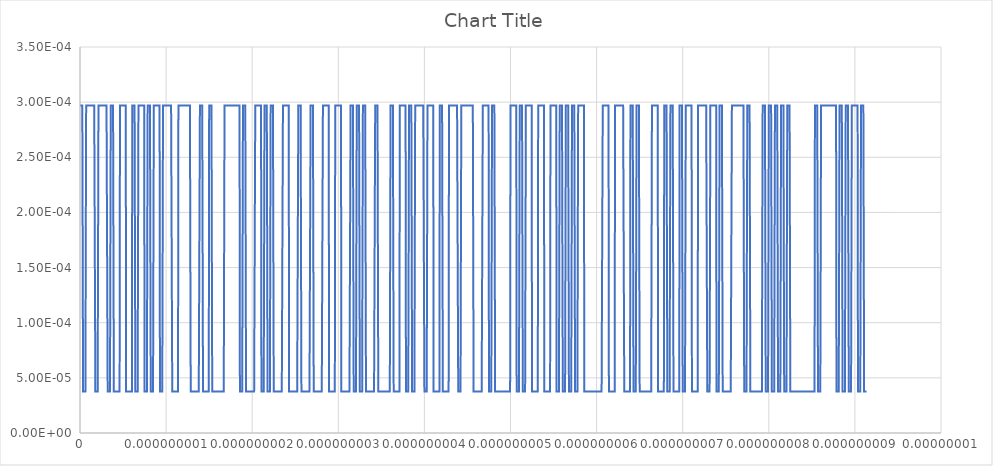
| Category | Series 0 |
|---|---|
| 0.0 | 0 |
| 2.23214285714285e-12 | 0 |
| 4.46428571428571e-12 | 0 |
| 6.69642857142857e-12 | 0 |
| 8.92857142857142e-12 | 0 |
| 1.11607142857142e-11 | 0 |
| 1.33928571428571e-11 | 0 |
| 1.5625e-11 | 0 |
| 1.78571428571428e-11 | 0 |
| 2.00892857142857e-11 | 0 |
| 2.23214285714285e-11 | 0 |
| 2.45535714285714e-11 | 0 |
| 2.67857142857142e-11 | 0 |
| 2.90178571428571e-11 | 0 |
| 3.125e-11 | 0 |
| 3.34821428571428e-11 | 0 |
| 3.57142857142857e-11 | 0 |
| 3.79464285714285e-11 | 0 |
| 4.01785714285714e-11 | 0 |
| 4.24107142857142e-11 | 0 |
| 4.46428571428571e-11 | 0 |
| 4.6875e-11 | 0 |
| 4.91071428571428e-11 | 0 |
| 5.13392857142857e-11 | 0 |
| 5.35714285714285e-11 | 0 |
| 5.58035714285714e-11 | 0 |
| 5.80357142857142e-11 | 0 |
| 6.02678571428571e-11 | 0 |
| 6.25e-11 | 0 |
| 6.47321428571428e-11 | 0 |
| 6.69642857142857e-11 | 0 |
| 6.91964285714285e-11 | 0 |
| 7.14285714285714e-11 | 0 |
| 7.36607142857142e-11 | 0 |
| 7.58928571428571e-11 | 0 |
| 7.8125e-11 | 0 |
| 8.03571428571428e-11 | 0 |
| 8.25892857142857e-11 | 0 |
| 8.48214285714285e-11 | 0 |
| 8.70535714285714e-11 | 0 |
| 8.92857142857142e-11 | 0 |
| 9.15178571428571e-11 | 0 |
| 9.37499999999999e-11 | 0 |
| 9.59821428571428e-11 | 0 |
| 9.82142857142857e-11 | 0 |
| 1.00446428571428e-10 | 0 |
| 1.02678571428571e-10 | 0 |
| 1.04910714285714e-10 | 0 |
| 1.07142857142857e-10 | 0 |
| 1.09375e-10 | 0 |
| 1.11607142857142e-10 | 0 |
| 1.13839285714285e-10 | 0 |
| 1.16071428571428e-10 | 0 |
| 1.18303571428571e-10 | 0 |
| 1.20535714285714e-10 | 0 |
| 1.22767857142857e-10 | 0 |
| 1.25e-10 | 0 |
| 1.27232142857142e-10 | 0 |
| 1.29464285714285e-10 | 0 |
| 1.31696428571428e-10 | 0 |
| 1.33928571428571e-10 | 0 |
| 1.36160714285714e-10 | 0 |
| 1.38392857142857e-10 | 0 |
| 1.40624999999999e-10 | 0 |
| 1.42857142857142e-10 | 0 |
| 1.45089285714285e-10 | 0 |
| 1.47321428571428e-10 | 0 |
| 1.49553571428571e-10 | 0 |
| 1.51785714285714e-10 | 0 |
| 1.54017857142857e-10 | 0 |
| 1.5625e-10 | 0 |
| 1.58482142857142e-10 | 0 |
| 1.60714285714285e-10 | 0 |
| 1.62946428571428e-10 | 0 |
| 1.65178571428571e-10 | 0 |
| 1.67410714285714e-10 | 0 |
| 1.69642857142857e-10 | 0 |
| 1.71874999999999e-10 | 0 |
| 1.74107142857142e-10 | 0 |
| 1.76339285714285e-10 | 0 |
| 1.78571428571428e-10 | 0 |
| 1.80803571428571e-10 | 0 |
| 1.83035714285714e-10 | 0 |
| 1.85267857142857e-10 | 0 |
| 1.875e-10 | 0 |
| 1.89732142857142e-10 | 0 |
| 1.91964285714285e-10 | 0 |
| 1.94196428571428e-10 | 0 |
| 1.96428571428571e-10 | 0 |
| 1.98660714285714e-10 | 0 |
| 2.00892857142857e-10 | 0 |
| 2.03125e-10 | 0 |
| 2.05357142857142e-10 | 0 |
| 2.07589285714285e-10 | 0 |
| 2.09821428571428e-10 | 0 |
| 2.12053571428571e-10 | 0 |
| 2.14285714285714e-10 | 0 |
| 2.16517857142857e-10 | 0 |
| 2.18749999999999e-10 | 0 |
| 2.20982142857142e-10 | 0 |
| 2.23214285714285e-10 | 0 |
| 2.25446428571428e-10 | 0 |
| 2.27678571428571e-10 | 0 |
| 2.29910714285714e-10 | 0 |
| 2.32142857142857e-10 | 0 |
| 2.34374999999999e-10 | 0 |
| 2.36607142857142e-10 | 0 |
| 2.38839285714285e-10 | 0 |
| 2.41071428571428e-10 | 0 |
| 2.43303571428571e-10 | 0 |
| 2.45535714285714e-10 | 0 |
| 2.47767857142857e-10 | 0 |
| 2.5e-10 | 0 |
| 2.52232142857142e-10 | 0 |
| 2.54464285714285e-10 | 0 |
| 2.56696428571428e-10 | 0 |
| 2.58928571428571e-10 | 0 |
| 2.61160714285714e-10 | 0 |
| 2.63392857142857e-10 | 0 |
| 2.65625e-10 | 0 |
| 2.67857142857142e-10 | 0 |
| 2.70089285714285e-10 | 0 |
| 2.72321428571428e-10 | 0 |
| 2.74553571428571e-10 | 0 |
| 2.76785714285714e-10 | 0 |
| 2.79017857142857e-10 | 0 |
| 2.81249999999999e-10 | 0 |
| 2.83482142857142e-10 | 0 |
| 2.85714285714285e-10 | 0 |
| 2.87946428571428e-10 | 0 |
| 2.90178571428571e-10 | 0 |
| 2.92410714285714e-10 | 0 |
| 2.94642857142857e-10 | 0 |
| 2.96874999999999e-10 | 0 |
| 2.99107142857142e-10 | 0 |
| 3.01339285714285e-10 | 0 |
| 3.03571428571428e-10 | 0 |
| 3.05803571428571e-10 | 0 |
| 3.08035714285714e-10 | 0 |
| 3.10267857142857e-10 | 0 |
| 3.125e-10 | 0 |
| 3.14732142857142e-10 | 0 |
| 3.16964285714285e-10 | 0 |
| 3.19196428571428e-10 | 0 |
| 3.21428571428571e-10 | 0 |
| 3.23660714285714e-10 | 0 |
| 3.25892857142857e-10 | 0 |
| 3.28124999999999e-10 | 0 |
| 3.30357142857142e-10 | 0 |
| 3.32589285714285e-10 | 0 |
| 3.34821428571428e-10 | 0 |
| 3.37053571428571e-10 | 0 |
| 3.39285714285714e-10 | 0 |
| 3.41517857142857e-10 | 0 |
| 3.43749999999999e-10 | 0 |
| 3.45982142857142e-10 | 0 |
| 3.48214285714285e-10 | 0 |
| 3.50446428571428e-10 | 0 |
| 3.52678571428571e-10 | 0 |
| 3.54910714285714e-10 | 0 |
| 3.57142857142857e-10 | 0 |
| 3.59375e-10 | 0 |
| 3.61607142857142e-10 | 0 |
| 3.63839285714285e-10 | 0 |
| 3.66071428571428e-10 | 0 |
| 3.68303571428571e-10 | 0 |
| 3.70535714285714e-10 | 0 |
| 3.72767857142857e-10 | 0 |
| 3.75e-10 | 0 |
| 3.77232142857142e-10 | 0 |
| 3.79464285714285e-10 | 0 |
| 3.81696428571428e-10 | 0 |
| 3.83928571428571e-10 | 0 |
| 3.86160714285714e-10 | 0 |
| 3.88392857142857e-10 | 0 |
| 3.90624999999999e-10 | 0 |
| 3.92857142857142e-10 | 0 |
| 3.95089285714285e-10 | 0 |
| 3.97321428571428e-10 | 0 |
| 3.99553571428571e-10 | 0 |
| 4.01785714285714e-10 | 0 |
| 4.04017857142857e-10 | 0 |
| 4.0625e-10 | 0 |
| 4.08482142857142e-10 | 0 |
| 4.10714285714285e-10 | 0 |
| 4.12946428571428e-10 | 0 |
| 4.15178571428571e-10 | 0 |
| 4.17410714285714e-10 | 0 |
| 4.19642857142857e-10 | 0 |
| 4.21875e-10 | 0 |
| 4.24107142857142e-10 | 0 |
| 4.26339285714285e-10 | 0 |
| 4.28571428571428e-10 | 0 |
| 4.30803571428571e-10 | 0 |
| 4.33035714285714e-10 | 0 |
| 4.35267857142857e-10 | 0 |
| 4.37499999999999e-10 | 0 |
| 4.39732142857142e-10 | 0 |
| 4.41964285714285e-10 | 0 |
| 4.44196428571428e-10 | 0 |
| 4.46428571428571e-10 | 0 |
| 4.48660714285714e-10 | 0 |
| 4.50892857142857e-10 | 0 |
| 4.53124999999999e-10 | 0 |
| 4.55357142857142e-10 | 0 |
| 4.57589285714285e-10 | 0 |
| 4.59821428571428e-10 | 0 |
| 4.62053571428571e-10 | 0 |
| 4.64285714285714e-10 | 0 |
| 4.66517857142857e-10 | 0 |
| 4.68749999999999e-10 | 0 |
| 4.70982142857142e-10 | 0 |
| 4.73214285714285e-10 | 0 |
| 4.75446428571428e-10 | 0 |
| 4.77678571428571e-10 | 0 |
| 4.79910714285714e-10 | 0 |
| 4.82142857142857e-10 | 0 |
| 4.84374999999999e-10 | 0 |
| 4.86607142857142e-10 | 0 |
| 4.88839285714285e-10 | 0 |
| 4.91071428571428e-10 | 0 |
| 4.93303571428571e-10 | 0 |
| 4.95535714285714e-10 | 0 |
| 4.97767857142857e-10 | 0 |
| 5e-10 | 0 |
| 5.02232142857142e-10 | 0 |
| 5.04464285714285e-10 | 0 |
| 5.06696428571428e-10 | 0 |
| 5.08928571428571e-10 | 0 |
| 5.11160714285714e-10 | 0 |
| 5.13392857142857e-10 | 0 |
| 5.15624999999999e-10 | 0 |
| 5.17857142857142e-10 | 0 |
| 5.20089285714285e-10 | 0 |
| 5.22321428571428e-10 | 0 |
| 5.24553571428571e-10 | 0 |
| 5.26785714285714e-10 | 0 |
| 5.29017857142857e-10 | 0 |
| 5.3125e-10 | 0 |
| 5.33482142857142e-10 | 0 |
| 5.35714285714285e-10 | 0 |
| 5.37946428571428e-10 | 0 |
| 5.40178571428571e-10 | 0 |
| 5.42410714285714e-10 | 0 |
| 5.44642857142857e-10 | 0 |
| 5.46875e-10 | 0 |
| 5.49107142857142e-10 | 0 |
| 5.51339285714285e-10 | 0 |
| 5.53571428571428e-10 | 0 |
| 5.55803571428571e-10 | 0 |
| 5.58035714285714e-10 | 0 |
| 5.60267857142857e-10 | 0 |
| 5.62499999999999e-10 | 0 |
| 5.64732142857142e-10 | 0 |
| 5.66964285714285e-10 | 0 |
| 5.69196428571428e-10 | 0 |
| 5.71428571428571e-10 | 0 |
| 5.73660714285714e-10 | 0 |
| 5.75892857142857e-10 | 0 |
| 5.78125e-10 | 0 |
| 5.80357142857142e-10 | 0 |
| 5.82589285714285e-10 | 0 |
| 5.84821428571428e-10 | 0 |
| 5.87053571428571e-10 | 0 |
| 5.89285714285714e-10 | 0 |
| 5.91517857142857e-10 | 0 |
| 5.93749999999999e-10 | 0 |
| 5.95982142857142e-10 | 0 |
| 5.98214285714285e-10 | 0 |
| 6.00446428571428e-10 | 0 |
| 6.02678571428571e-10 | 0 |
| 6.04910714285714e-10 | 0 |
| 6.07142857142857e-10 | 0 |
| 6.09374999999999e-10 | 0 |
| 6.11607142857142e-10 | 0 |
| 6.13839285714285e-10 | 0 |
| 6.16071428571428e-10 | 0 |
| 6.18303571428571e-10 | 0 |
| 6.20535714285714e-10 | 0 |
| 6.22767857142857e-10 | 0 |
| 6.25e-10 | 0 |
| 6.27232142857142e-10 | 0 |
| 6.29464285714285e-10 | 0 |
| 6.31696428571428e-10 | 0 |
| 6.33928571428571e-10 | 0 |
| 6.36160714285714e-10 | 0 |
| 6.38392857142857e-10 | 0 |
| 6.40624999999999e-10 | 0 |
| 6.42857142857142e-10 | 0 |
| 6.45089285714285e-10 | 0 |
| 6.47321428571428e-10 | 0 |
| 6.49553571428571e-10 | 0 |
| 6.51785714285714e-10 | 0 |
| 6.54017857142857e-10 | 0 |
| 6.56249999999999e-10 | 0 |
| 6.58482142857142e-10 | 0 |
| 6.60714285714285e-10 | 0 |
| 6.62946428571428e-10 | 0 |
| 6.65178571428571e-10 | 0 |
| 6.67410714285714e-10 | 0 |
| 6.69642857142857e-10 | 0 |
| 6.71875e-10 | 0 |
| 6.74107142857142e-10 | 0 |
| 6.76339285714285e-10 | 0 |
| 6.78571428571428e-10 | 0 |
| 6.80803571428571e-10 | 0 |
| 6.83035714285714e-10 | 0 |
| 6.85267857142857e-10 | 0 |
| 6.87499999999999e-10 | 0 |
| 6.89732142857142e-10 | 0 |
| 6.91964285714285e-10 | 0 |
| 6.94196428571428e-10 | 0 |
| 6.96428571428571e-10 | 0 |
| 6.98660714285714e-10 | 0 |
| 7.00892857142857e-10 | 0 |
| 7.03124999999999e-10 | 0 |
| 7.05357142857142e-10 | 0 |
| 7.07589285714285e-10 | 0 |
| 7.09821428571428e-10 | 0 |
| 7.12053571428571e-10 | 0 |
| 7.14285714285714e-10 | 0 |
| 7.16517857142857e-10 | 0 |
| 7.1875e-10 | 0 |
| 7.20982142857142e-10 | 0 |
| 7.23214285714285e-10 | 0 |
| 7.25446428571428e-10 | 0 |
| 7.27678571428571e-10 | 0 |
| 7.29910714285714e-10 | 0 |
| 7.32142857142857e-10 | 0 |
| 7.34374999999999e-10 | 0 |
| 7.36607142857142e-10 | 0 |
| 7.38839285714285e-10 | 0 |
| 7.41071428571428e-10 | 0 |
| 7.43303571428571e-10 | 0 |
| 7.45535714285714e-10 | 0 |
| 7.47767857142857e-10 | 0 |
| 7.5e-10 | 0 |
| 7.52232142857142e-10 | 0 |
| 7.54464285714285e-10 | 0 |
| 7.56696428571428e-10 | 0 |
| 7.58928571428571e-10 | 0 |
| 7.61160714285714e-10 | 0 |
| 7.63392857142857e-10 | 0 |
| 7.65625e-10 | 0 |
| 7.67857142857142e-10 | 0 |
| 7.70089285714285e-10 | 0 |
| 7.72321428571428e-10 | 0 |
| 7.74553571428571e-10 | 0 |
| 7.76785714285714e-10 | 0 |
| 7.79017857142857e-10 | 0 |
| 7.81249999999999e-10 | 0 |
| 7.83482142857142e-10 | 0 |
| 7.85714285714285e-10 | 0 |
| 7.87946428571428e-10 | 0 |
| 7.90178571428571e-10 | 0 |
| 7.92410714285714e-10 | 0 |
| 7.94642857142857e-10 | 0 |
| 7.96875e-10 | 0 |
| 7.99107142857142e-10 | 0 |
| 8.01339285714285e-10 | 0 |
| 8.03571428571428e-10 | 0 |
| 8.05803571428571e-10 | 0 |
| 8.08035714285714e-10 | 0 |
| 8.10267857142857e-10 | 0 |
| 8.125e-10 | 0 |
| 8.14732142857142e-10 | 0 |
| 8.16964285714285e-10 | 0 |
| 8.19196428571428e-10 | 0 |
| 8.21428571428571e-10 | 0 |
| 8.23660714285714e-10 | 0 |
| 8.25892857142857e-10 | 0 |
| 8.28124999999999e-10 | 0 |
| 8.30357142857142e-10 | 0 |
| 8.32589285714285e-10 | 0 |
| 8.34821428571428e-10 | 0 |
| 8.37053571428571e-10 | 0 |
| 8.39285714285714e-10 | 0 |
| 8.41517857142857e-10 | 0 |
| 8.4375e-10 | 0 |
| 8.45982142857142e-10 | 0 |
| 8.48214285714285e-10 | 0 |
| 8.50446428571428e-10 | 0 |
| 8.52678571428571e-10 | 0 |
| 8.54910714285714e-10 | 0 |
| 8.57142857142857e-10 | 0 |
| 8.59374999999999e-10 | 0 |
| 8.61607142857142e-10 | 0 |
| 8.63839285714285e-10 | 0 |
| 8.66071428571428e-10 | 0 |
| 8.68303571428571e-10 | 0 |
| 8.70535714285714e-10 | 0 |
| 8.72767857142857e-10 | 0 |
| 8.74999999999999e-10 | 0 |
| 8.77232142857142e-10 | 0 |
| 8.79464285714285e-10 | 0 |
| 8.81696428571428e-10 | 0 |
| 8.83928571428571e-10 | 0 |
| 8.86160714285714e-10 | 0 |
| 8.88392857142857e-10 | 0 |
| 8.90625e-10 | 0 |
| 8.92857142857142e-10 | 0 |
| 8.95089285714285e-10 | 0 |
| 8.97321428571428e-10 | 0 |
| 8.99553571428571e-10 | 0 |
| 9.01785714285714e-10 | 0 |
| 9.04017857142857e-10 | 0 |
| 9.06249999999999e-10 | 0 |
| 9.08482142857142e-10 | 0 |
| 9.10714285714285e-10 | 0 |
| 9.12946428571428e-10 | 0 |
| 9.15178571428571e-10 | 0 |
| 9.17410714285714e-10 | 0 |
| 9.19642857142857e-10 | 0 |
| 9.21874999999999e-10 | 0 |
| 9.24107142857142e-10 | 0 |
| 9.26339285714285e-10 | 0 |
| 9.28571428571428e-10 | 0 |
| 9.30803571428571e-10 | 0 |
| 9.33035714285714e-10 | 0 |
| 9.35267857142857e-10 | 0 |
| 9.37499999999999e-10 | 0 |
| 9.39732142857142e-10 | 0 |
| 9.41964285714285e-10 | 0 |
| 9.44196428571428e-10 | 0 |
| 9.46428571428571e-10 | 0 |
| 9.48660714285714e-10 | 0 |
| 9.50892857142857e-10 | 0 |
| 9.53125e-10 | 0 |
| 9.55357142857142e-10 | 0 |
| 9.57589285714285e-10 | 0 |
| 9.59821428571428e-10 | 0 |
| 9.62053571428571e-10 | 0 |
| 9.64285714285714e-10 | 0 |
| 9.66517857142857e-10 | 0 |
| 9.68749999999999e-10 | 0 |
| 9.70982142857142e-10 | 0 |
| 9.73214285714285e-10 | 0 |
| 9.75446428571428e-10 | 0 |
| 9.77678571428571e-10 | 0 |
| 9.79910714285714e-10 | 0 |
| 9.82142857142857e-10 | 0 |
| 9.84374999999999e-10 | 0 |
| 9.86607142857142e-10 | 0 |
| 9.88839285714285e-10 | 0 |
| 9.91071428571428e-10 | 0 |
| 9.93303571428571e-10 | 0 |
| 9.95535714285714e-10 | 0 |
| 9.97767857142857e-10 | 0 |
| 1e-09 | 0 |
| 1.00223214285714e-09 | 0 |
| 1.00446428571428e-09 | 0 |
| 1.00669642857142e-09 | 0 |
| 1.00892857142857e-09 | 0 |
| 1.01116071428571e-09 | 0 |
| 1.01339285714285e-09 | 0 |
| 1.015625e-09 | 0 |
| 1.01785714285714e-09 | 0 |
| 1.02008928571428e-09 | 0 |
| 1.02232142857142e-09 | 0 |
| 1.02455357142857e-09 | 0 |
| 1.02678571428571e-09 | 0 |
| 1.02901785714285e-09 | 0 |
| 1.03124999999999e-09 | 0 |
| 1.03348214285714e-09 | 0 |
| 1.03571428571428e-09 | 0 |
| 1.03794642857142e-09 | 0 |
| 1.04017857142857e-09 | 0 |
| 1.04241071428571e-09 | 0 |
| 1.04464285714285e-09 | 0 |
| 1.046875e-09 | 0 |
| 1.04910714285714e-09 | 0 |
| 1.05133928571428e-09 | 0 |
| 1.05357142857142e-09 | 0 |
| 1.05580357142857e-09 | 0 |
| 1.05803571428571e-09 | 0 |
| 1.06026785714285e-09 | 0 |
| 1.0625e-09 | 0 |
| 1.06473214285714e-09 | 0 |
| 1.06696428571428e-09 | 0 |
| 1.06919642857142e-09 | 0 |
| 1.07142857142857e-09 | 0 |
| 1.07366071428571e-09 | 0 |
| 1.07589285714285e-09 | 0 |
| 1.07812499999999e-09 | 0 |
| 1.08035714285714e-09 | 0 |
| 1.08258928571428e-09 | 0 |
| 1.08482142857142e-09 | 0 |
| 1.08705357142857e-09 | 0 |
| 1.08928571428571e-09 | 0 |
| 1.09151785714285e-09 | 0 |
| 1.09375e-09 | 0 |
| 1.09598214285714e-09 | 0 |
| 1.09821428571428e-09 | 0 |
| 1.10044642857142e-09 | 0 |
| 1.10267857142857e-09 | 0 |
| 1.10491071428571e-09 | 0 |
| 1.10714285714285e-09 | 0 |
| 1.109375e-09 | 0 |
| 1.11160714285714e-09 | 0 |
| 1.11383928571428e-09 | 0 |
| 1.11607142857142e-09 | 0 |
| 1.11830357142857e-09 | 0 |
| 1.12053571428571e-09 | 0 |
| 1.12276785714285e-09 | 0 |
| 1.12499999999999e-09 | 0 |
| 1.12723214285714e-09 | 0 |
| 1.12946428571428e-09 | 0 |
| 1.13169642857142e-09 | 0 |
| 1.13392857142857e-09 | 0 |
| 1.13616071428571e-09 | 0 |
| 1.13839285714285e-09 | 0 |
| 1.140625e-09 | 0 |
| 1.14285714285714e-09 | 0 |
| 1.14508928571428e-09 | 0 |
| 1.14732142857142e-09 | 0 |
| 1.14955357142857e-09 | 0 |
| 1.15178571428571e-09 | 0 |
| 1.15401785714285e-09 | 0 |
| 1.15625e-09 | 0 |
| 1.15848214285714e-09 | 0 |
| 1.16071428571428e-09 | 0 |
| 1.16294642857142e-09 | 0 |
| 1.16517857142857e-09 | 0 |
| 1.16741071428571e-09 | 0 |
| 1.16964285714285e-09 | 0 |
| 1.17187499999999e-09 | 0 |
| 1.17410714285714e-09 | 0 |
| 1.17633928571428e-09 | 0 |
| 1.17857142857142e-09 | 0 |
| 1.18080357142857e-09 | 0 |
| 1.18303571428571e-09 | 0 |
| 1.18526785714285e-09 | 0 |
| 1.18749999999999e-09 | 0 |
| 1.18973214285714e-09 | 0 |
| 1.19196428571428e-09 | 0 |
| 1.19419642857142e-09 | 0 |
| 1.19642857142857e-09 | 0 |
| 1.19866071428571e-09 | 0 |
| 1.20089285714285e-09 | 0 |
| 1.203125e-09 | 0 |
| 1.20535714285714e-09 | 0 |
| 1.20758928571428e-09 | 0 |
| 1.20982142857142e-09 | 0 |
| 1.21205357142857e-09 | 0 |
| 1.21428571428571e-09 | 0 |
| 1.21651785714285e-09 | 0 |
| 1.21875e-09 | 0 |
| 1.22098214285714e-09 | 0 |
| 1.22321428571428e-09 | 0 |
| 1.22544642857142e-09 | 0 |
| 1.22767857142857e-09 | 0 |
| 1.22991071428571e-09 | 0 |
| 1.23214285714285e-09 | 0 |
| 1.23437499999999e-09 | 0 |
| 1.23660714285714e-09 | 0 |
| 1.23883928571428e-09 | 0 |
| 1.24107142857142e-09 | 0 |
| 1.24330357142857e-09 | 0 |
| 1.24553571428571e-09 | 0 |
| 1.24776785714285e-09 | 0 |
| 1.25e-09 | 0 |
| 1.25223214285714e-09 | 0 |
| 1.25446428571428e-09 | 0 |
| 1.25669642857142e-09 | 0 |
| 1.25892857142857e-09 | 0 |
| 1.26116071428571e-09 | 0 |
| 1.26339285714285e-09 | 0 |
| 1.265625e-09 | 0 |
| 1.26785714285714e-09 | 0 |
| 1.27008928571428e-09 | 0 |
| 1.27232142857142e-09 | 0 |
| 1.27455357142857e-09 | 0 |
| 1.27678571428571e-09 | 0 |
| 1.27901785714285e-09 | 0 |
| 1.28124999999999e-09 | 0 |
| 1.28348214285714e-09 | 0 |
| 1.28571428571428e-09 | 0 |
| 1.28794642857142e-09 | 0 |
| 1.29017857142857e-09 | 0 |
| 1.29241071428571e-09 | 0 |
| 1.29464285714285e-09 | 0 |
| 1.296875e-09 | 0 |
| 1.29910714285714e-09 | 0 |
| 1.30133928571428e-09 | 0 |
| 1.30357142857142e-09 | 0 |
| 1.30580357142857e-09 | 0 |
| 1.30803571428571e-09 | 0 |
| 1.31026785714285e-09 | 0 |
| 1.3125e-09 | 0 |
| 1.31473214285714e-09 | 0 |
| 1.31696428571428e-09 | 0 |
| 1.31919642857142e-09 | 0 |
| 1.32142857142857e-09 | 0 |
| 1.32366071428571e-09 | 0 |
| 1.32589285714285e-09 | 0 |
| 1.32812499999999e-09 | 0 |
| 1.33035714285714e-09 | 0 |
| 1.33258928571428e-09 | 0 |
| 1.33482142857142e-09 | 0 |
| 1.33705357142857e-09 | 0 |
| 1.33928571428571e-09 | 0 |
| 1.34151785714285e-09 | 0 |
| 1.34375e-09 | 0 |
| 1.34598214285714e-09 | 0 |
| 1.34821428571428e-09 | 0 |
| 1.35044642857142e-09 | 0 |
| 1.35267857142857e-09 | 0 |
| 1.35491071428571e-09 | 0 |
| 1.35714285714285e-09 | 0 |
| 1.359375e-09 | 0 |
| 1.36160714285714e-09 | 0 |
| 1.36383928571428e-09 | 0 |
| 1.36607142857142e-09 | 0 |
| 1.36830357142857e-09 | 0 |
| 1.37053571428571e-09 | 0 |
| 1.37276785714285e-09 | 0 |
| 1.37499999999999e-09 | 0 |
| 1.37723214285714e-09 | 0 |
| 1.37946428571428e-09 | 0 |
| 1.38169642857142e-09 | 0 |
| 1.38392857142857e-09 | 0 |
| 1.38616071428571e-09 | 0 |
| 1.38839285714285e-09 | 0 |
| 1.390625e-09 | 0 |
| 1.39285714285714e-09 | 0 |
| 1.39508928571428e-09 | 0 |
| 1.39732142857142e-09 | 0 |
| 1.39955357142857e-09 | 0 |
| 1.40178571428571e-09 | 0 |
| 1.40401785714285e-09 | 0 |
| 1.40625e-09 | 0 |
| 1.40848214285714e-09 | 0 |
| 1.41071428571428e-09 | 0 |
| 1.41294642857142e-09 | 0 |
| 1.41517857142857e-09 | 0 |
| 1.41741071428571e-09 | 0 |
| 1.41964285714285e-09 | 0 |
| 1.42187499999999e-09 | 0 |
| 1.42410714285714e-09 | 0 |
| 1.42633928571428e-09 | 0 |
| 1.42857142857142e-09 | 0 |
| 1.43080357142857e-09 | 0 |
| 1.43303571428571e-09 | 0 |
| 1.43526785714285e-09 | 0 |
| 1.4375e-09 | 0 |
| 1.43973214285714e-09 | 0 |
| 1.44196428571428e-09 | 0 |
| 1.44419642857142e-09 | 0 |
| 1.44642857142857e-09 | 0 |
| 1.44866071428571e-09 | 0 |
| 1.45089285714285e-09 | 0 |
| 1.453125e-09 | 0 |
| 1.45535714285714e-09 | 0 |
| 1.45758928571428e-09 | 0 |
| 1.45982142857142e-09 | 0 |
| 1.46205357142857e-09 | 0 |
| 1.46428571428571e-09 | 0 |
| 1.46651785714285e-09 | 0 |
| 1.46874999999999e-09 | 0 |
| 1.47098214285714e-09 | 0 |
| 1.47321428571428e-09 | 0 |
| 1.47544642857142e-09 | 0 |
| 1.47767857142857e-09 | 0 |
| 1.47991071428571e-09 | 0 |
| 1.48214285714285e-09 | 0 |
| 1.484375e-09 | 0 |
| 1.48660714285714e-09 | 0 |
| 1.48883928571428e-09 | 0 |
| 1.49107142857142e-09 | 0 |
| 1.49330357142857e-09 | 0 |
| 1.49553571428571e-09 | 0 |
| 1.49776785714285e-09 | 0 |
| 1.5e-09 | 0 |
| 1.50223214285714e-09 | 0 |
| 1.50446428571428e-09 | 0 |
| 1.50669642857142e-09 | 0 |
| 1.50892857142857e-09 | 0 |
| 1.51116071428571e-09 | 0 |
| 1.51339285714285e-09 | 0 |
| 1.51562499999999e-09 | 0 |
| 1.51785714285714e-09 | 0 |
| 1.52008928571428e-09 | 0 |
| 1.52232142857142e-09 | 0 |
| 1.52455357142857e-09 | 0 |
| 1.52678571428571e-09 | 0 |
| 1.52901785714285e-09 | 0 |
| 1.53125e-09 | 0 |
| 1.53348214285714e-09 | 0 |
| 1.53571428571428e-09 | 0 |
| 1.53794642857142e-09 | 0 |
| 1.54017857142857e-09 | 0 |
| 1.54241071428571e-09 | 0 |
| 1.54464285714285e-09 | 0 |
| 1.546875e-09 | 0 |
| 1.54910714285714e-09 | 0 |
| 1.55133928571428e-09 | 0 |
| 1.55357142857142e-09 | 0 |
| 1.55580357142857e-09 | 0 |
| 1.55803571428571e-09 | 0 |
| 1.56026785714285e-09 | 0 |
| 1.56249999999999e-09 | 0 |
| 1.56473214285714e-09 | 0 |
| 1.56696428571428e-09 | 0 |
| 1.56919642857142e-09 | 0 |
| 1.57142857142857e-09 | 0 |
| 1.57366071428571e-09 | 0 |
| 1.57589285714285e-09 | 0 |
| 1.578125e-09 | 0 |
| 1.58035714285714e-09 | 0 |
| 1.58258928571428e-09 | 0 |
| 1.58482142857142e-09 | 0 |
| 1.58705357142857e-09 | 0 |
| 1.58928571428571e-09 | 0 |
| 1.59151785714285e-09 | 0 |
| 1.59375e-09 | 0 |
| 1.59598214285714e-09 | 0 |
| 1.59821428571428e-09 | 0 |
| 1.60044642857142e-09 | 0 |
| 1.60267857142857e-09 | 0 |
| 1.60491071428571e-09 | 0 |
| 1.60714285714285e-09 | 0 |
| 1.60937499999999e-09 | 0 |
| 1.61160714285714e-09 | 0 |
| 1.61383928571428e-09 | 0 |
| 1.61607142857142e-09 | 0 |
| 1.61830357142857e-09 | 0 |
| 1.62053571428571e-09 | 0 |
| 1.62276785714285e-09 | 0 |
| 1.625e-09 | 0 |
| 1.62723214285714e-09 | 0 |
| 1.62946428571428e-09 | 0 |
| 1.63169642857142e-09 | 0 |
| 1.63392857142857e-09 | 0 |
| 1.63616071428571e-09 | 0 |
| 1.63839285714285e-09 | 0 |
| 1.640625e-09 | 0 |
| 1.64285714285714e-09 | 0 |
| 1.64508928571428e-09 | 0 |
| 1.64732142857142e-09 | 0 |
| 1.64955357142857e-09 | 0 |
| 1.65178571428571e-09 | 0 |
| 1.65401785714285e-09 | 0 |
| 1.65624999999999e-09 | 0 |
| 1.65848214285714e-09 | 0 |
| 1.66071428571428e-09 | 0 |
| 1.66294642857142e-09 | 0 |
| 1.66517857142857e-09 | 0 |
| 1.66741071428571e-09 | 0 |
| 1.66964285714285e-09 | 0 |
| 1.67187499999999e-09 | 0 |
| 1.67410714285714e-09 | 0 |
| 1.67633928571428e-09 | 0 |
| 1.67857142857142e-09 | 0 |
| 1.68080357142857e-09 | 0 |
| 1.68303571428571e-09 | 0 |
| 1.68526785714285e-09 | 0 |
| 1.6875e-09 | 0 |
| 1.68973214285714e-09 | 0 |
| 1.69196428571428e-09 | 0 |
| 1.69419642857142e-09 | 0 |
| 1.69642857142857e-09 | 0 |
| 1.69866071428571e-09 | 0 |
| 1.70089285714285e-09 | 0 |
| 1.70312499999999e-09 | 0 |
| 1.70535714285714e-09 | 0 |
| 1.70758928571428e-09 | 0 |
| 1.70982142857142e-09 | 0 |
| 1.71205357142857e-09 | 0 |
| 1.71428571428571e-09 | 0 |
| 1.71651785714285e-09 | 0 |
| 1.71874999999999e-09 | 0 |
| 1.72098214285714e-09 | 0 |
| 1.72321428571428e-09 | 0 |
| 1.72544642857142e-09 | 0 |
| 1.72767857142857e-09 | 0 |
| 1.72991071428571e-09 | 0 |
| 1.73214285714285e-09 | 0 |
| 1.734375e-09 | 0 |
| 1.73660714285714e-09 | 0 |
| 1.73883928571428e-09 | 0 |
| 1.74107142857142e-09 | 0 |
| 1.74330357142857e-09 | 0 |
| 1.74553571428571e-09 | 0 |
| 1.74776785714285e-09 | 0 |
| 1.75e-09 | 0 |
| 1.75223214285714e-09 | 0 |
| 1.75446428571428e-09 | 0 |
| 1.75669642857142e-09 | 0 |
| 1.75892857142857e-09 | 0 |
| 1.76116071428571e-09 | 0 |
| 1.76339285714285e-09 | 0 |
| 1.76562499999999e-09 | 0 |
| 1.76785714285714e-09 | 0 |
| 1.77008928571428e-09 | 0 |
| 1.77232142857142e-09 | 0 |
| 1.77455357142857e-09 | 0 |
| 1.77678571428571e-09 | 0 |
| 1.77901785714285e-09 | 0 |
| 1.78125e-09 | 0 |
| 1.78348214285714e-09 | 0 |
| 1.78571428571428e-09 | 0 |
| 1.78794642857142e-09 | 0 |
| 1.79017857142857e-09 | 0 |
| 1.79241071428571e-09 | 0 |
| 1.79464285714285e-09 | 0 |
| 1.796875e-09 | 0 |
| 1.79910714285714e-09 | 0 |
| 1.80133928571428e-09 | 0 |
| 1.80357142857142e-09 | 0 |
| 1.80580357142857e-09 | 0 |
| 1.80803571428571e-09 | 0 |
| 1.81026785714285e-09 | 0 |
| 1.81249999999999e-09 | 0 |
| 1.81473214285714e-09 | 0 |
| 1.81696428571428e-09 | 0 |
| 1.81919642857142e-09 | 0 |
| 1.82142857142857e-09 | 0 |
| 1.82366071428571e-09 | 0 |
| 1.82589285714285e-09 | 0 |
| 1.828125e-09 | 0 |
| 1.83035714285714e-09 | 0 |
| 1.83258928571428e-09 | 0 |
| 1.83482142857142e-09 | 0 |
| 1.83705357142857e-09 | 0 |
| 1.83928571428571e-09 | 0 |
| 1.84151785714285e-09 | 0 |
| 1.84375e-09 | 0 |
| 1.84598214285714e-09 | 0 |
| 1.84821428571428e-09 | 0 |
| 1.85044642857142e-09 | 0 |
| 1.85267857142857e-09 | 0 |
| 1.85491071428571e-09 | 0 |
| 1.85714285714285e-09 | 0 |
| 1.85937499999999e-09 | 0 |
| 1.86160714285714e-09 | 0 |
| 1.86383928571428e-09 | 0 |
| 1.86607142857142e-09 | 0 |
| 1.86830357142857e-09 | 0 |
| 1.87053571428571e-09 | 0 |
| 1.87276785714285e-09 | 0 |
| 1.87499999999999e-09 | 0 |
| 1.87723214285714e-09 | 0 |
| 1.87946428571428e-09 | 0 |
| 1.88169642857142e-09 | 0 |
| 1.88392857142857e-09 | 0 |
| 1.88616071428571e-09 | 0 |
| 1.88839285714285e-09 | 0 |
| 1.89062499999999e-09 | 0 |
| 1.89285714285714e-09 | 0 |
| 1.89508928571428e-09 | 0 |
| 1.89732142857142e-09 | 0 |
| 1.89955357142857e-09 | 0 |
| 1.90178571428571e-09 | 0 |
| 1.90401785714285e-09 | 0 |
| 1.90625e-09 | 0 |
| 1.90848214285714e-09 | 0 |
| 1.91071428571428e-09 | 0 |
| 1.91294642857142e-09 | 0 |
| 1.91517857142857e-09 | 0 |
| 1.91741071428571e-09 | 0 |
| 1.91964285714285e-09 | 0 |
| 1.921875e-09 | 0 |
| 1.92410714285714e-09 | 0 |
| 1.92633928571428e-09 | 0 |
| 1.92857142857142e-09 | 0 |
| 1.93080357142857e-09 | 0 |
| 1.93303571428571e-09 | 0 |
| 1.93526785714285e-09 | 0 |
| 1.9375e-09 | 0 |
| 1.93973214285714e-09 | 0 |
| 1.94196428571428e-09 | 0 |
| 1.94419642857142e-09 | 0 |
| 1.94642857142857e-09 | 0 |
| 1.94866071428571e-09 | 0 |
| 1.95089285714285e-09 | 0 |
| 1.95312499999999e-09 | 0 |
| 1.95535714285714e-09 | 0 |
| 1.95758928571428e-09 | 0 |
| 1.95982142857142e-09 | 0 |
| 1.96205357142857e-09 | 0 |
| 1.96428571428571e-09 | 0 |
| 1.96651785714285e-09 | 0 |
| 1.96874999999999e-09 | 0 |
| 1.97098214285714e-09 | 0 |
| 1.97321428571428e-09 | 0 |
| 1.97544642857142e-09 | 0 |
| 1.97767857142857e-09 | 0 |
| 1.97991071428571e-09 | 0 |
| 1.98214285714285e-09 | 0 |
| 1.98437499999999e-09 | 0 |
| 1.98660714285714e-09 | 0 |
| 1.98883928571428e-09 | 0 |
| 1.99107142857142e-09 | 0 |
| 1.99330357142857e-09 | 0 |
| 1.99553571428571e-09 | 0 |
| 1.99776785714285e-09 | 0 |
| 2e-09 | 0 |
| 2.00223214285714e-09 | 0 |
| 2.00446428571428e-09 | 0 |
| 2.00669642857142e-09 | 0 |
| 2.00892857142857e-09 | 0 |
| 2.01116071428571e-09 | 0 |
| 2.01339285714285e-09 | 0 |
| 2.015625e-09 | 0 |
| 2.01785714285714e-09 | 0 |
| 2.02008928571428e-09 | 0 |
| 2.02232142857142e-09 | 0 |
| 2.02455357142857e-09 | 0 |
| 2.02678571428571e-09 | 0 |
| 2.02901785714285e-09 | 0 |
| 2.03125e-09 | 0 |
| 2.03348214285714e-09 | 0 |
| 2.03571428571428e-09 | 0 |
| 2.03794642857142e-09 | 0 |
| 2.04017857142857e-09 | 0 |
| 2.04241071428571e-09 | 0 |
| 2.04464285714285e-09 | 0 |
| 2.04687499999999e-09 | 0 |
| 2.04910714285714e-09 | 0 |
| 2.05133928571428e-09 | 0 |
| 2.05357142857142e-09 | 0 |
| 2.05580357142857e-09 | 0 |
| 2.05803571428571e-09 | 0 |
| 2.06026785714285e-09 | 0 |
| 2.06249999999999e-09 | 0 |
| 2.06473214285714e-09 | 0 |
| 2.06696428571428e-09 | 0 |
| 2.06919642857142e-09 | 0 |
| 2.07142857142857e-09 | 0 |
| 2.07366071428571e-09 | 0 |
| 2.07589285714285e-09 | 0 |
| 2.07812499999999e-09 | 0 |
| 2.08035714285714e-09 | 0 |
| 2.08258928571428e-09 | 0 |
| 2.08482142857142e-09 | 0 |
| 2.08705357142857e-09 | 0 |
| 2.08928571428571e-09 | 0 |
| 2.09151785714285e-09 | 0 |
| 2.09375e-09 | 0 |
| 2.09598214285714e-09 | 0 |
| 2.09821428571428e-09 | 0 |
| 2.10044642857142e-09 | 0 |
| 2.10267857142857e-09 | 0 |
| 2.10491071428571e-09 | 0 |
| 2.10714285714285e-09 | 0 |
| 2.109375e-09 | 0 |
| 2.11160714285714e-09 | 0 |
| 2.11383928571428e-09 | 0 |
| 2.11607142857142e-09 | 0 |
| 2.11830357142857e-09 | 0 |
| 2.12053571428571e-09 | 0 |
| 2.12276785714285e-09 | 0 |
| 2.125e-09 | 0 |
| 2.12723214285714e-09 | 0 |
| 2.12946428571428e-09 | 0 |
| 2.13169642857142e-09 | 0 |
| 2.13392857142857e-09 | 0 |
| 2.13616071428571e-09 | 0 |
| 2.13839285714285e-09 | 0 |
| 2.14062499999999e-09 | 0 |
| 2.14285714285714e-09 | 0 |
| 2.14508928571428e-09 | 0 |
| 2.14732142857142e-09 | 0 |
| 2.14955357142857e-09 | 0 |
| 2.15178571428571e-09 | 0 |
| 2.15401785714285e-09 | 0 |
| 2.15624999999999e-09 | 0 |
| 2.15848214285714e-09 | 0 |
| 2.16071428571428e-09 | 0 |
| 2.16294642857142e-09 | 0 |
| 2.16517857142857e-09 | 0 |
| 2.16741071428571e-09 | 0 |
| 2.16964285714285e-09 | 0 |
| 2.17187499999999e-09 | 0 |
| 2.17410714285714e-09 | 0 |
| 2.17633928571428e-09 | 0 |
| 2.17857142857142e-09 | 0 |
| 2.18080357142857e-09 | 0 |
| 2.18303571428571e-09 | 0 |
| 2.18526785714285e-09 | 0 |
| 2.1875e-09 | 0 |
| 2.18973214285714e-09 | 0 |
| 2.19196428571428e-09 | 0 |
| 2.19419642857142e-09 | 0 |
| 2.19642857142857e-09 | 0 |
| 2.19866071428571e-09 | 0 |
| 2.20089285714285e-09 | 0 |
| 2.203125e-09 | 0 |
| 2.20535714285714e-09 | 0 |
| 2.20758928571428e-09 | 0 |
| 2.20982142857142e-09 | 0 |
| 2.21205357142857e-09 | 0 |
| 2.21428571428571e-09 | 0 |
| 2.21651785714285e-09 | 0 |
| 2.21875e-09 | 0 |
| 2.22098214285714e-09 | 0 |
| 2.22321428571428e-09 | 0 |
| 2.22544642857142e-09 | 0 |
| 2.22767857142857e-09 | 0 |
| 2.22991071428571e-09 | 0 |
| 2.23214285714285e-09 | 0 |
| 2.23437499999999e-09 | 0 |
| 2.23660714285714e-09 | 0 |
| 2.23883928571428e-09 | 0 |
| 2.24107142857142e-09 | 0 |
| 2.24330357142857e-09 | 0 |
| 2.24553571428571e-09 | 0 |
| 2.24776785714285e-09 | 0 |
| 2.24999999999999e-09 | 0 |
| 2.25223214285714e-09 | 0 |
| 2.25446428571428e-09 | 0 |
| 2.25669642857142e-09 | 0 |
| 2.25892857142857e-09 | 0 |
| 2.26116071428571e-09 | 0 |
| 2.26339285714285e-09 | 0 |
| 2.26562499999999e-09 | 0 |
| 2.26785714285714e-09 | 0 |
| 2.27008928571428e-09 | 0 |
| 2.27232142857142e-09 | 0 |
| 2.27455357142857e-09 | 0 |
| 2.27678571428571e-09 | 0 |
| 2.27901785714285e-09 | 0 |
| 2.28125e-09 | 0 |
| 2.28348214285714e-09 | 0 |
| 2.28571428571428e-09 | 0 |
| 2.28794642857142e-09 | 0 |
| 2.29017857142857e-09 | 0 |
| 2.29241071428571e-09 | 0 |
| 2.29464285714285e-09 | 0 |
| 2.296875e-09 | 0 |
| 2.29910714285714e-09 | 0 |
| 2.30133928571428e-09 | 0 |
| 2.30357142857142e-09 | 0 |
| 2.30580357142857e-09 | 0 |
| 2.30803571428571e-09 | 0 |
| 2.31026785714285e-09 | 0 |
| 2.3125e-09 | 0 |
| 2.31473214285714e-09 | 0 |
| 2.31696428571428e-09 | 0 |
| 2.31919642857142e-09 | 0 |
| 2.32142857142857e-09 | 0 |
| 2.32366071428571e-09 | 0 |
| 2.32589285714285e-09 | 0 |
| 2.328125e-09 | 0 |
| 2.33035714285714e-09 | 0 |
| 2.33258928571428e-09 | 0 |
| 2.33482142857142e-09 | 0 |
| 2.33705357142857e-09 | 0 |
| 2.33928571428571e-09 | 0 |
| 2.34151785714285e-09 | 0 |
| 2.34374999999999e-09 | 0 |
| 2.34598214285714e-09 | 0 |
| 2.34821428571428e-09 | 0 |
| 2.35044642857142e-09 | 0 |
| 2.35267857142857e-09 | 0 |
| 2.35491071428571e-09 | 0 |
| 2.35714285714285e-09 | 0 |
| 2.35937499999999e-09 | 0 |
| 2.36160714285714e-09 | 0 |
| 2.36383928571428e-09 | 0 |
| 2.36607142857142e-09 | 0 |
| 2.36830357142857e-09 | 0 |
| 2.37053571428571e-09 | 0 |
| 2.37276785714285e-09 | 0 |
| 2.37499999999999e-09 | 0 |
| 2.37723214285714e-09 | 0 |
| 2.37946428571428e-09 | 0 |
| 2.38169642857142e-09 | 0 |
| 2.38392857142857e-09 | 0 |
| 2.38616071428571e-09 | 0 |
| 2.38839285714285e-09 | 0 |
| 2.390625e-09 | 0 |
| 2.39285714285714e-09 | 0 |
| 2.39508928571428e-09 | 0 |
| 2.39732142857142e-09 | 0 |
| 2.39955357142857e-09 | 0 |
| 2.40178571428571e-09 | 0 |
| 2.40401785714285e-09 | 0 |
| 2.40625e-09 | 0 |
| 2.40848214285714e-09 | 0 |
| 2.41071428571428e-09 | 0 |
| 2.41294642857142e-09 | 0 |
| 2.41517857142857e-09 | 0 |
| 2.41741071428571e-09 | 0 |
| 2.41964285714285e-09 | 0 |
| 2.421875e-09 | 0 |
| 2.42410714285714e-09 | 0 |
| 2.42633928571428e-09 | 0 |
| 2.42857142857142e-09 | 0 |
| 2.43080357142857e-09 | 0 |
| 2.43303571428571e-09 | 0 |
| 2.43526785714285e-09 | 0 |
| 2.43749999999999e-09 | 0 |
| 2.43973214285714e-09 | 0 |
| 2.44196428571428e-09 | 0 |
| 2.44419642857142e-09 | 0 |
| 2.44642857142857e-09 | 0 |
| 2.44866071428571e-09 | 0 |
| 2.45089285714285e-09 | 0 |
| 2.45312499999999e-09 | 0 |
| 2.45535714285714e-09 | 0 |
| 2.45758928571428e-09 | 0 |
| 2.45982142857142e-09 | 0 |
| 2.46205357142857e-09 | 0 |
| 2.46428571428571e-09 | 0 |
| 2.46651785714285e-09 | 0 |
| 2.46874999999999e-09 | 0 |
| 2.47098214285714e-09 | 0 |
| 2.47321428571428e-09 | 0 |
| 2.47544642857142e-09 | 0 |
| 2.47767857142857e-09 | 0 |
| 2.47991071428571e-09 | 0 |
| 2.48214285714285e-09 | 0 |
| 2.484375e-09 | 0 |
| 2.48660714285714e-09 | 0 |
| 2.48883928571428e-09 | 0 |
| 2.49107142857142e-09 | 0 |
| 2.49330357142857e-09 | 0 |
| 2.49553571428571e-09 | 0 |
| 2.49776785714285e-09 | 0 |
| 2.5e-09 | 0 |
| 2.50223214285714e-09 | 0 |
| 2.50446428571428e-09 | 0 |
| 2.50669642857142e-09 | 0 |
| 2.50892857142857e-09 | 0 |
| 2.51116071428571e-09 | 0 |
| 2.51339285714285e-09 | 0 |
| 2.515625e-09 | 0 |
| 2.51785714285714e-09 | 0 |
| 2.52008928571428e-09 | 0 |
| 2.52232142857142e-09 | 0 |
| 2.52455357142857e-09 | 0 |
| 2.52678571428571e-09 | 0 |
| 2.52901785714285e-09 | 0 |
| 2.53124999999999e-09 | 0 |
| 2.53348214285714e-09 | 0 |
| 2.53571428571428e-09 | 0 |
| 2.53794642857142e-09 | 0 |
| 2.54017857142857e-09 | 0 |
| 2.54241071428571e-09 | 0 |
| 2.54464285714285e-09 | 0 |
| 2.54687499999999e-09 | 0 |
| 2.54910714285714e-09 | 0 |
| 2.55133928571428e-09 | 0 |
| 2.55357142857142e-09 | 0 |
| 2.55580357142857e-09 | 0 |
| 2.55803571428571e-09 | 0 |
| 2.56026785714285e-09 | 0 |
| 2.56249999999999e-09 | 0 |
| 2.56473214285714e-09 | 0 |
| 2.56696428571428e-09 | 0 |
| 2.56919642857142e-09 | 0 |
| 2.57142857142857e-09 | 0 |
| 2.57366071428571e-09 | 0 |
| 2.57589285714285e-09 | 0 |
| 2.578125e-09 | 0 |
| 2.58035714285714e-09 | 0 |
| 2.58258928571428e-09 | 0 |
| 2.58482142857142e-09 | 0 |
| 2.58705357142857e-09 | 0 |
| 2.58928571428571e-09 | 0 |
| 2.59151785714285e-09 | 0 |
| 2.59375e-09 | 0 |
| 2.59598214285714e-09 | 0 |
| 2.59821428571428e-09 | 0 |
| 2.60044642857142e-09 | 0 |
| 2.60267857142857e-09 | 0 |
| 2.60491071428571e-09 | 0 |
| 2.60714285714285e-09 | 0 |
| 2.609375e-09 | 0 |
| 2.61160714285714e-09 | 0 |
| 2.61383928571428e-09 | 0 |
| 2.61607142857142e-09 | 0 |
| 2.61830357142857e-09 | 0 |
| 2.62053571428571e-09 | 0 |
| 2.62276785714285e-09 | 0 |
| 2.62499999999999e-09 | 0 |
| 2.62723214285714e-09 | 0 |
| 2.62946428571428e-09 | 0 |
| 2.63169642857142e-09 | 0 |
| 2.63392857142857e-09 | 0 |
| 2.63616071428571e-09 | 0 |
| 2.63839285714285e-09 | 0 |
| 2.64062499999999e-09 | 0 |
| 2.64285714285714e-09 | 0 |
| 2.64508928571428e-09 | 0 |
| 2.64732142857142e-09 | 0 |
| 2.64955357142857e-09 | 0 |
| 2.65178571428571e-09 | 0 |
| 2.65401785714285e-09 | 0 |
| 2.65624999999999e-09 | 0 |
| 2.65848214285714e-09 | 0 |
| 2.66071428571428e-09 | 0 |
| 2.66294642857142e-09 | 0 |
| 2.66517857142857e-09 | 0 |
| 2.66741071428571e-09 | 0 |
| 2.66964285714285e-09 | 0 |
| 2.671875e-09 | 0 |
| 2.67410714285714e-09 | 0 |
| 2.67633928571428e-09 | 0 |
| 2.67857142857142e-09 | 0 |
| 2.68080357142857e-09 | 0 |
| 2.68303571428571e-09 | 0 |
| 2.68526785714285e-09 | 0 |
| 2.6875e-09 | 0 |
| 2.68973214285714e-09 | 0 |
| 2.69196428571428e-09 | 0 |
| 2.69419642857142e-09 | 0 |
| 2.69642857142857e-09 | 0 |
| 2.69866071428571e-09 | 0 |
| 2.70089285714285e-09 | 0 |
| 2.703125e-09 | 0 |
| 2.70535714285714e-09 | 0 |
| 2.70758928571428e-09 | 0 |
| 2.70982142857142e-09 | 0 |
| 2.71205357142857e-09 | 0 |
| 2.71428571428571e-09 | 0 |
| 2.71651785714285e-09 | 0 |
| 2.71874999999999e-09 | 0 |
| 2.72098214285714e-09 | 0 |
| 2.72321428571428e-09 | 0 |
| 2.72544642857142e-09 | 0 |
| 2.72767857142857e-09 | 0 |
| 2.72991071428571e-09 | 0 |
| 2.73214285714285e-09 | 0 |
| 2.73437499999999e-09 | 0 |
| 2.73660714285714e-09 | 0 |
| 2.73883928571428e-09 | 0 |
| 2.74107142857142e-09 | 0 |
| 2.74330357142857e-09 | 0 |
| 2.74553571428571e-09 | 0 |
| 2.74776785714285e-09 | 0 |
| 2.74999999999999e-09 | 0 |
| 2.75223214285714e-09 | 0 |
| 2.75446428571428e-09 | 0 |
| 2.75669642857142e-09 | 0 |
| 2.75892857142857e-09 | 0 |
| 2.76116071428571e-09 | 0 |
| 2.76339285714285e-09 | 0 |
| 2.765625e-09 | 0 |
| 2.76785714285714e-09 | 0 |
| 2.77008928571428e-09 | 0 |
| 2.77232142857142e-09 | 0 |
| 2.77455357142857e-09 | 0 |
| 2.77678571428571e-09 | 0 |
| 2.77901785714285e-09 | 0 |
| 2.78125e-09 | 0 |
| 2.78348214285714e-09 | 0 |
| 2.78571428571428e-09 | 0 |
| 2.78794642857142e-09 | 0 |
| 2.79017857142857e-09 | 0 |
| 2.79241071428571e-09 | 0 |
| 2.79464285714285e-09 | 0 |
| 2.796875e-09 | 0 |
| 2.79910714285714e-09 | 0 |
| 2.80133928571428e-09 | 0 |
| 2.80357142857142e-09 | 0 |
| 2.80580357142857e-09 | 0 |
| 2.80803571428571e-09 | 0 |
| 2.81026785714285e-09 | 0 |
| 2.8125e-09 | 0 |
| 2.81473214285714e-09 | 0 |
| 2.81696428571428e-09 | 0 |
| 2.81919642857142e-09 | 0 |
| 2.82142857142857e-09 | 0 |
| 2.82366071428571e-09 | 0 |
| 2.82589285714285e-09 | 0 |
| 2.82812499999999e-09 | 0 |
| 2.83035714285714e-09 | 0 |
| 2.83258928571428e-09 | 0 |
| 2.83482142857142e-09 | 0 |
| 2.83705357142857e-09 | 0 |
| 2.83928571428571e-09 | 0 |
| 2.84151785714285e-09 | 0 |
| 2.84374999999999e-09 | 0 |
| 2.84598214285714e-09 | 0 |
| 2.84821428571428e-09 | 0 |
| 2.85044642857142e-09 | 0 |
| 2.85267857142857e-09 | 0 |
| 2.85491071428571e-09 | 0 |
| 2.85714285714285e-09 | 0 |
| 2.85937499999999e-09 | 0 |
| 2.86160714285714e-09 | 0 |
| 2.86383928571428e-09 | 0 |
| 2.86607142857142e-09 | 0 |
| 2.86830357142857e-09 | 0 |
| 2.87053571428571e-09 | 0 |
| 2.87276785714285e-09 | 0 |
| 2.875e-09 | 0 |
| 2.87723214285714e-09 | 0 |
| 2.87946428571428e-09 | 0 |
| 2.88169642857142e-09 | 0 |
| 2.88392857142857e-09 | 0 |
| 2.88616071428571e-09 | 0 |
| 2.88839285714285e-09 | 0 |
| 2.890625e-09 | 0 |
| 2.89285714285714e-09 | 0 |
| 2.89508928571428e-09 | 0 |
| 2.89732142857142e-09 | 0 |
| 2.89955357142857e-09 | 0 |
| 2.90178571428571e-09 | 0 |
| 2.90401785714285e-09 | 0 |
| 2.90625e-09 | 0 |
| 2.90848214285714e-09 | 0 |
| 2.91071428571428e-09 | 0 |
| 2.91294642857142e-09 | 0 |
| 2.91517857142857e-09 | 0 |
| 2.91741071428571e-09 | 0 |
| 2.91964285714285e-09 | 0 |
| 2.92187499999999e-09 | 0 |
| 2.92410714285714e-09 | 0 |
| 2.92633928571428e-09 | 0 |
| 2.92857142857142e-09 | 0 |
| 2.93080357142857e-09 | 0 |
| 2.93303571428571e-09 | 0 |
| 2.93526785714285e-09 | 0 |
| 2.93749999999999e-09 | 0 |
| 2.93973214285714e-09 | 0 |
| 2.94196428571428e-09 | 0 |
| 2.94419642857142e-09 | 0 |
| 2.94642857142857e-09 | 0 |
| 2.94866071428571e-09 | 0 |
| 2.95089285714285e-09 | 0 |
| 2.95312499999999e-09 | 0 |
| 2.95535714285714e-09 | 0 |
| 2.95758928571428e-09 | 0 |
| 2.95982142857142e-09 | 0 |
| 2.96205357142857e-09 | 0 |
| 2.96428571428571e-09 | 0 |
| 2.96651785714285e-09 | 0 |
| 2.96875e-09 | 0 |
| 2.97098214285714e-09 | 0 |
| 2.97321428571428e-09 | 0 |
| 2.97544642857142e-09 | 0 |
| 2.97767857142857e-09 | 0 |
| 2.97991071428571e-09 | 0 |
| 2.98214285714285e-09 | 0 |
| 2.984375e-09 | 0 |
| 2.98660714285714e-09 | 0 |
| 2.98883928571428e-09 | 0 |
| 2.99107142857142e-09 | 0 |
| 2.99330357142857e-09 | 0 |
| 2.99553571428571e-09 | 0 |
| 2.99776785714285e-09 | 0 |
| 3e-09 | 0 |
| 3.00223214285714e-09 | 0 |
| 3.00446428571428e-09 | 0 |
| 3.00669642857142e-09 | 0 |
| 3.00892857142857e-09 | 0 |
| 3.01116071428571e-09 | 0 |
| 3.01339285714285e-09 | 0 |
| 3.01562499999999e-09 | 0 |
| 3.01785714285714e-09 | 0 |
| 3.02008928571428e-09 | 0 |
| 3.02232142857142e-09 | 0 |
| 3.02455357142857e-09 | 0 |
| 3.02678571428571e-09 | 0 |
| 3.02901785714285e-09 | 0 |
| 3.03124999999999e-09 | 0 |
| 3.03348214285714e-09 | 0 |
| 3.03571428571428e-09 | 0 |
| 3.03794642857142e-09 | 0 |
| 3.04017857142857e-09 | 0 |
| 3.04241071428571e-09 | 0 |
| 3.04464285714285e-09 | 0 |
| 3.04687499999999e-09 | 0 |
| 3.04910714285714e-09 | 0 |
| 3.05133928571428e-09 | 0 |
| 3.05357142857142e-09 | 0 |
| 3.05580357142857e-09 | 0 |
| 3.05803571428571e-09 | 0 |
| 3.06026785714285e-09 | 0 |
| 3.0625e-09 | 0 |
| 3.06473214285714e-09 | 0 |
| 3.06696428571428e-09 | 0 |
| 3.06919642857142e-09 | 0 |
| 3.07142857142857e-09 | 0 |
| 3.07366071428571e-09 | 0 |
| 3.07589285714285e-09 | 0 |
| 3.078125e-09 | 0 |
| 3.08035714285714e-09 | 0 |
| 3.08258928571428e-09 | 0 |
| 3.08482142857142e-09 | 0 |
| 3.08705357142857e-09 | 0 |
| 3.08928571428571e-09 | 0 |
| 3.09151785714285e-09 | 0 |
| 3.09375e-09 | 0 |
| 3.09598214285714e-09 | 0 |
| 3.09821428571428e-09 | 0 |
| 3.10044642857142e-09 | 0 |
| 3.10267857142857e-09 | 0 |
| 3.10491071428571e-09 | 0 |
| 3.10714285714285e-09 | 0 |
| 3.10937499999999e-09 | 0 |
| 3.11160714285714e-09 | 0 |
| 3.11383928571428e-09 | 0 |
| 3.11607142857142e-09 | 0 |
| 3.11830357142857e-09 | 0 |
| 3.12053571428571e-09 | 0 |
| 3.12276785714285e-09 | 0 |
| 3.12499999999999e-09 | 0 |
| 3.12723214285714e-09 | 0 |
| 3.12946428571428e-09 | 0 |
| 3.13169642857142e-09 | 0 |
| 3.13392857142857e-09 | 0 |
| 3.13616071428571e-09 | 0 |
| 3.13839285714285e-09 | 0 |
| 3.14062499999999e-09 | 0 |
| 3.14285714285714e-09 | 0 |
| 3.14508928571428e-09 | 0 |
| 3.14732142857142e-09 | 0 |
| 3.14955357142857e-09 | 0 |
| 3.15178571428571e-09 | 0 |
| 3.15401785714285e-09 | 0 |
| 3.15625e-09 | 0 |
| 3.15848214285714e-09 | 0 |
| 3.16071428571428e-09 | 0 |
| 3.16294642857142e-09 | 0 |
| 3.16517857142857e-09 | 0 |
| 3.16741071428571e-09 | 0 |
| 3.16964285714285e-09 | 0 |
| 3.171875e-09 | 0 |
| 3.17410714285714e-09 | 0 |
| 3.17633928571428e-09 | 0 |
| 3.17857142857142e-09 | 0 |
| 3.18080357142857e-09 | 0 |
| 3.18303571428571e-09 | 0 |
| 3.18526785714285e-09 | 0 |
| 3.1875e-09 | 0 |
| 3.18973214285714e-09 | 0 |
| 3.19196428571428e-09 | 0 |
| 3.19419642857142e-09 | 0 |
| 3.19642857142857e-09 | 0 |
| 3.19866071428571e-09 | 0 |
| 3.20089285714285e-09 | 0 |
| 3.20312499999999e-09 | 0 |
| 3.20535714285714e-09 | 0 |
| 3.20758928571428e-09 | 0 |
| 3.20982142857142e-09 | 0 |
| 3.21205357142857e-09 | 0 |
| 3.21428571428571e-09 | 0 |
| 3.21651785714285e-09 | 0 |
| 3.21874999999999e-09 | 0 |
| 3.22098214285714e-09 | 0 |
| 3.22321428571428e-09 | 0 |
| 3.22544642857142e-09 | 0 |
| 3.22767857142857e-09 | 0 |
| 3.22991071428571e-09 | 0 |
| 3.23214285714285e-09 | 0 |
| 3.23437499999999e-09 | 0 |
| 3.23660714285714e-09 | 0 |
| 3.23883928571428e-09 | 0 |
| 3.24107142857142e-09 | 0 |
| 3.24330357142857e-09 | 0 |
| 3.24553571428571e-09 | 0 |
| 3.24776785714285e-09 | 0 |
| 3.25e-09 | 0 |
| 3.25223214285714e-09 | 0 |
| 3.25446428571428e-09 | 0 |
| 3.25669642857142e-09 | 0 |
| 3.25892857142857e-09 | 0 |
| 3.26116071428571e-09 | 0 |
| 3.26339285714285e-09 | 0 |
| 3.265625e-09 | 0 |
| 3.26785714285714e-09 | 0 |
| 3.27008928571428e-09 | 0 |
| 3.27232142857142e-09 | 0 |
| 3.27455357142857e-09 | 0 |
| 3.27678571428571e-09 | 0 |
| 3.27901785714285e-09 | 0 |
| 3.28125e-09 | 0 |
| 3.28348214285714e-09 | 0 |
| 3.28571428571428e-09 | 0 |
| 3.28794642857142e-09 | 0 |
| 3.29017857142857e-09 | 0 |
| 3.29241071428571e-09 | 0 |
| 3.29464285714285e-09 | 0 |
| 3.296875e-09 | 0 |
| 3.29910714285714e-09 | 0 |
| 3.30133928571428e-09 | 0 |
| 3.30357142857142e-09 | 0 |
| 3.30580357142857e-09 | 0 |
| 3.30803571428571e-09 | 0 |
| 3.31026785714285e-09 | 0 |
| 3.31249999999999e-09 | 0 |
| 3.31473214285714e-09 | 0 |
| 3.31696428571428e-09 | 0 |
| 3.31919642857142e-09 | 0 |
| 3.32142857142857e-09 | 0 |
| 3.32366071428571e-09 | 0 |
| 3.32589285714285e-09 | 0 |
| 3.32812499999999e-09 | 0 |
| 3.33035714285714e-09 | 0 |
| 3.33258928571428e-09 | 0 |
| 3.33482142857142e-09 | 0 |
| 3.33705357142857e-09 | 0 |
| 3.33928571428571e-09 | 0 |
| 3.34151785714285e-09 | 0 |
| 3.34374999999999e-09 | 0 |
| 3.34598214285714e-09 | 0 |
| 3.34821428571428e-09 | 0 |
| 3.35044642857142e-09 | 0 |
| 3.35267857142857e-09 | 0 |
| 3.35491071428571e-09 | 0 |
| 3.35714285714285e-09 | 0 |
| 3.359375e-09 | 0 |
| 3.36160714285714e-09 | 0 |
| 3.36383928571428e-09 | 0 |
| 3.36607142857142e-09 | 0 |
| 3.36830357142857e-09 | 0 |
| 3.37053571428571e-09 | 0 |
| 3.37276785714285e-09 | 0 |
| 3.375e-09 | 0 |
| 3.37723214285714e-09 | 0 |
| 3.37946428571428e-09 | 0 |
| 3.38169642857142e-09 | 0 |
| 3.38392857142857e-09 | 0 |
| 3.38616071428571e-09 | 0 |
| 3.38839285714285e-09 | 0 |
| 3.390625e-09 | 0 |
| 3.39285714285714e-09 | 0 |
| 3.39508928571428e-09 | 0 |
| 3.39732142857142e-09 | 0 |
| 3.39955357142857e-09 | 0 |
| 3.40178571428571e-09 | 0 |
| 3.40401785714285e-09 | 0 |
| 3.40624999999999e-09 | 0 |
| 3.40848214285714e-09 | 0 |
| 3.41071428571428e-09 | 0 |
| 3.41294642857142e-09 | 0 |
| 3.41517857142857e-09 | 0 |
| 3.41741071428571e-09 | 0 |
| 3.41964285714285e-09 | 0 |
| 3.42187499999999e-09 | 0 |
| 3.42410714285714e-09 | 0 |
| 3.42633928571428e-09 | 0 |
| 3.42857142857142e-09 | 0 |
| 3.43080357142857e-09 | 0 |
| 3.43303571428571e-09 | 0 |
| 3.43526785714285e-09 | 0 |
| 3.43749999999999e-09 | 0 |
| 3.43973214285714e-09 | 0 |
| 3.44196428571428e-09 | 0 |
| 3.44419642857142e-09 | 0 |
| 3.44642857142857e-09 | 0 |
| 3.44866071428571e-09 | 0 |
| 3.45089285714285e-09 | 0 |
| 3.453125e-09 | 0 |
| 3.45535714285714e-09 | 0 |
| 3.45758928571428e-09 | 0 |
| 3.45982142857142e-09 | 0 |
| 3.46205357142857e-09 | 0 |
| 3.46428571428571e-09 | 0 |
| 3.46651785714285e-09 | 0 |
| 3.46875e-09 | 0 |
| 3.47098214285714e-09 | 0 |
| 3.47321428571428e-09 | 0 |
| 3.47544642857142e-09 | 0 |
| 3.47767857142857e-09 | 0 |
| 3.47991071428571e-09 | 0 |
| 3.48214285714285e-09 | 0 |
| 3.484375e-09 | 0 |
| 3.48660714285714e-09 | 0 |
| 3.48883928571428e-09 | 0 |
| 3.49107142857142e-09 | 0 |
| 3.49330357142857e-09 | 0 |
| 3.49553571428571e-09 | 0 |
| 3.49776785714285e-09 | 0 |
| 3.49999999999999e-09 | 0 |
| 3.50223214285714e-09 | 0 |
| 3.50446428571428e-09 | 0 |
| 3.50669642857142e-09 | 0 |
| 3.50892857142857e-09 | 0 |
| 3.51116071428571e-09 | 0 |
| 3.51339285714285e-09 | 0 |
| 3.51562499999999e-09 | 0 |
| 3.51785714285714e-09 | 0 |
| 3.52008928571428e-09 | 0 |
| 3.52232142857142e-09 | 0 |
| 3.52455357142857e-09 | 0 |
| 3.52678571428571e-09 | 0 |
| 3.52901785714285e-09 | 0 |
| 3.53124999999999e-09 | 0 |
| 3.53348214285714e-09 | 0 |
| 3.53571428571428e-09 | 0 |
| 3.53794642857142e-09 | 0 |
| 3.54017857142857e-09 | 0 |
| 3.54241071428571e-09 | 0 |
| 3.54464285714285e-09 | 0 |
| 3.546875e-09 | 0 |
| 3.54910714285714e-09 | 0 |
| 3.55133928571428e-09 | 0 |
| 3.55357142857142e-09 | 0 |
| 3.55580357142857e-09 | 0 |
| 3.55803571428571e-09 | 0 |
| 3.56026785714285e-09 | 0 |
| 3.5625e-09 | 0 |
| 3.56473214285714e-09 | 0 |
| 3.56696428571428e-09 | 0 |
| 3.56919642857142e-09 | 0 |
| 3.57142857142857e-09 | 0 |
| 3.57366071428571e-09 | 0 |
| 3.57589285714285e-09 | 0 |
| 3.578125e-09 | 0 |
| 3.58035714285714e-09 | 0 |
| 3.58258928571428e-09 | 0 |
| 3.58482142857142e-09 | 0 |
| 3.58705357142857e-09 | 0 |
| 3.58928571428571e-09 | 0 |
| 3.59151785714285e-09 | 0 |
| 3.59374999999999e-09 | 0 |
| 3.59598214285714e-09 | 0 |
| 3.59821428571428e-09 | 0 |
| 3.60044642857142e-09 | 0 |
| 3.60267857142857e-09 | 0 |
| 3.60491071428571e-09 | 0 |
| 3.60714285714285e-09 | 0 |
| 3.60937499999999e-09 | 0 |
| 3.61160714285714e-09 | 0 |
| 3.61383928571428e-09 | 0 |
| 3.61607142857142e-09 | 0 |
| 3.61830357142857e-09 | 0 |
| 3.62053571428571e-09 | 0 |
| 3.62276785714285e-09 | 0 |
| 3.62499999999999e-09 | 0 |
| 3.62723214285714e-09 | 0 |
| 3.62946428571428e-09 | 0 |
| 3.63169642857142e-09 | 0 |
| 3.63392857142857e-09 | 0 |
| 3.63616071428571e-09 | 0 |
| 3.63839285714285e-09 | 0 |
| 3.640625e-09 | 0 |
| 3.64285714285714e-09 | 0 |
| 3.64508928571428e-09 | 0 |
| 3.64732142857142e-09 | 0 |
| 3.64955357142857e-09 | 0 |
| 3.65178571428571e-09 | 0 |
| 3.65401785714285e-09 | 0 |
| 3.65625e-09 | 0 |
| 3.65848214285714e-09 | 0 |
| 3.66071428571428e-09 | 0 |
| 3.66294642857142e-09 | 0 |
| 3.66517857142857e-09 | 0 |
| 3.66741071428571e-09 | 0 |
| 3.66964285714285e-09 | 0 |
| 3.671875e-09 | 0 |
| 3.67410714285714e-09 | 0 |
| 3.67633928571428e-09 | 0 |
| 3.67857142857142e-09 | 0 |
| 3.68080357142857e-09 | 0 |
| 3.68303571428571e-09 | 0 |
| 3.68526785714285e-09 | 0 |
| 3.68749999999999e-09 | 0 |
| 3.68973214285714e-09 | 0 |
| 3.69196428571428e-09 | 0 |
| 3.69419642857142e-09 | 0 |
| 3.69642857142857e-09 | 0 |
| 3.69866071428571e-09 | 0 |
| 3.70089285714285e-09 | 0 |
| 3.70312499999999e-09 | 0 |
| 3.70535714285714e-09 | 0 |
| 3.70758928571428e-09 | 0 |
| 3.70982142857142e-09 | 0 |
| 3.71205357142857e-09 | 0 |
| 3.71428571428571e-09 | 0 |
| 3.71651785714285e-09 | 0 |
| 3.71874999999999e-09 | 0 |
| 3.72098214285714e-09 | 0 |
| 3.72321428571428e-09 | 0 |
| 3.72544642857142e-09 | 0 |
| 3.72767857142857e-09 | 0 |
| 3.72991071428571e-09 | 0 |
| 3.73214285714285e-09 | 0 |
| 3.734375e-09 | 0 |
| 3.73660714285714e-09 | 0 |
| 3.73883928571428e-09 | 0 |
| 3.74107142857142e-09 | 0 |
| 3.74330357142857e-09 | 0 |
| 3.74553571428571e-09 | 0 |
| 3.74776785714285e-09 | 0 |
| 3.74999999999999e-09 | 0 |
| 3.75223214285714e-09 | 0 |
| 3.75446428571428e-09 | 0 |
| 3.75669642857142e-09 | 0 |
| 3.75892857142857e-09 | 0 |
| 3.76116071428571e-09 | 0 |
| 3.76339285714285e-09 | 0 |
| 3.765625e-09 | 0 |
| 3.76785714285714e-09 | 0 |
| 3.77008928571428e-09 | 0 |
| 3.77232142857142e-09 | 0 |
| 3.77455357142857e-09 | 0 |
| 3.77678571428571e-09 | 0 |
| 3.77901785714285e-09 | 0 |
| 3.78124999999999e-09 | 0 |
| 3.78348214285714e-09 | 0 |
| 3.78571428571428e-09 | 0 |
| 3.78794642857142e-09 | 0 |
| 3.79017857142857e-09 | 0 |
| 3.79241071428571e-09 | 0 |
| 3.79464285714285e-09 | 0 |
| 3.79687499999999e-09 | 0 |
| 3.79910714285714e-09 | 0 |
| 3.80133928571428e-09 | 0 |
| 3.80357142857142e-09 | 0 |
| 3.80580357142857e-09 | 0 |
| 3.80803571428571e-09 | 0 |
| 3.81026785714285e-09 | 0 |
| 3.8125e-09 | 0 |
| 3.81473214285714e-09 | 0 |
| 3.81696428571428e-09 | 0 |
| 3.81919642857142e-09 | 0 |
| 3.82142857142857e-09 | 0 |
| 3.82366071428571e-09 | 0 |
| 3.82589285714285e-09 | 0 |
| 3.82812499999999e-09 | 0 |
| 3.83035714285714e-09 | 0 |
| 3.83258928571428e-09 | 0 |
| 3.83482142857142e-09 | 0 |
| 3.83705357142857e-09 | 0 |
| 3.83928571428571e-09 | 0 |
| 3.84151785714285e-09 | 0 |
| 3.84375e-09 | 0 |
| 3.84598214285714e-09 | 0 |
| 3.84821428571428e-09 | 0 |
| 3.85044642857142e-09 | 0 |
| 3.85267857142857e-09 | 0 |
| 3.85491071428571e-09 | 0 |
| 3.85714285714285e-09 | 0 |
| 3.85937499999999e-09 | 0 |
| 3.86160714285714e-09 | 0 |
| 3.86383928571428e-09 | 0 |
| 3.86607142857142e-09 | 0 |
| 3.86830357142857e-09 | 0 |
| 3.87053571428571e-09 | 0 |
| 3.87276785714285e-09 | 0 |
| 3.875e-09 | 0 |
| 3.87723214285714e-09 | 0 |
| 3.87946428571428e-09 | 0 |
| 3.88169642857142e-09 | 0 |
| 3.88392857142857e-09 | 0 |
| 3.88616071428571e-09 | 0 |
| 3.88839285714285e-09 | 0 |
| 3.890625e-09 | 0 |
| 3.89285714285714e-09 | 0 |
| 3.89508928571428e-09 | 0 |
| 3.89732142857142e-09 | 0 |
| 3.89955357142857e-09 | 0 |
| 3.90178571428571e-09 | 0 |
| 3.90401785714285e-09 | 0 |
| 3.90624999999999e-09 | 0 |
| 3.90848214285714e-09 | 0 |
| 3.91071428571428e-09 | 0 |
| 3.91294642857142e-09 | 0 |
| 3.91517857142857e-09 | 0 |
| 3.91741071428571e-09 | 0 |
| 3.91964285714285e-09 | 0 |
| 3.921875e-09 | 0 |
| 3.92410714285714e-09 | 0 |
| 3.92633928571428e-09 | 0 |
| 3.92857142857142e-09 | 0 |
| 3.93080357142857e-09 | 0 |
| 3.93303571428571e-09 | 0 |
| 3.93526785714285e-09 | 0 |
| 3.93749999999999e-09 | 0 |
| 3.93973214285714e-09 | 0 |
| 3.94196428571428e-09 | 0 |
| 3.94419642857142e-09 | 0 |
| 3.94642857142857e-09 | 0 |
| 3.94866071428571e-09 | 0 |
| 3.95089285714285e-09 | 0 |
| 3.953125e-09 | 0 |
| 3.95535714285714e-09 | 0 |
| 3.95758928571428e-09 | 0 |
| 3.95982142857142e-09 | 0 |
| 3.96205357142857e-09 | 0 |
| 3.96428571428571e-09 | 0 |
| 3.96651785714285e-09 | 0 |
| 3.96874999999999e-09 | 0 |
| 3.97098214285714e-09 | 0 |
| 3.97321428571428e-09 | 0 |
| 3.97544642857142e-09 | 0 |
| 3.97767857142857e-09 | 0 |
| 3.97991071428571e-09 | 0 |
| 3.98214285714285e-09 | 0 |
| 3.98437499999999e-09 | 0 |
| 3.98660714285714e-09 | 0 |
| 3.98883928571428e-09 | 0 |
| 3.99107142857142e-09 | 0 |
| 3.99330357142857e-09 | 0 |
| 3.99553571428571e-09 | 0 |
| 3.99776785714285e-09 | 0 |
| 4e-09 | 0 |
| 4.00223214285714e-09 | 0 |
| 4.00446428571428e-09 | 0 |
| 4.00669642857142e-09 | 0 |
| 4.00892857142857e-09 | 0 |
| 4.01116071428571e-09 | 0 |
| 4.01339285714285e-09 | 0 |
| 4.01562499999999e-09 | 0 |
| 4.01785714285714e-09 | 0 |
| 4.02008928571428e-09 | 0 |
| 4.02232142857142e-09 | 0 |
| 4.02455357142857e-09 | 0 |
| 4.02678571428571e-09 | 0 |
| 4.02901785714285e-09 | 0 |
| 4.03125e-09 | 0 |
| 4.03348214285714e-09 | 0 |
| 4.03571428571428e-09 | 0 |
| 4.03794642857142e-09 | 0 |
| 4.04017857142857e-09 | 0 |
| 4.04241071428571e-09 | 0 |
| 4.04464285714285e-09 | 0 |
| 4.04687499999999e-09 | 0 |
| 4.04910714285714e-09 | 0 |
| 4.05133928571428e-09 | 0 |
| 4.05357142857142e-09 | 0 |
| 4.05580357142857e-09 | 0 |
| 4.05803571428571e-09 | 0 |
| 4.06026785714285e-09 | 0 |
| 4.0625e-09 | 0 |
| 4.06473214285714e-09 | 0 |
| 4.06696428571428e-09 | 0 |
| 4.06919642857142e-09 | 0 |
| 4.07142857142857e-09 | 0 |
| 4.07366071428571e-09 | 0 |
| 4.07589285714285e-09 | 0 |
| 4.078125e-09 | 0 |
| 4.08035714285714e-09 | 0 |
| 4.08258928571428e-09 | 0 |
| 4.08482142857142e-09 | 0 |
| 4.08705357142857e-09 | 0 |
| 4.08928571428571e-09 | 0 |
| 4.09151785714285e-09 | 0 |
| 4.09374999999999e-09 | 0 |
| 4.09598214285714e-09 | 0 |
| 4.09821428571428e-09 | 0 |
| 4.10044642857142e-09 | 0 |
| 4.10267857142857e-09 | 0 |
| 4.10491071428571e-09 | 0 |
| 4.10714285714285e-09 | 0 |
| 4.109375e-09 | 0 |
| 4.11160714285714e-09 | 0 |
| 4.11383928571428e-09 | 0 |
| 4.11607142857142e-09 | 0 |
| 4.11830357142857e-09 | 0 |
| 4.12053571428571e-09 | 0 |
| 4.12276785714285e-09 | 0 |
| 4.12499999999999e-09 | 0 |
| 4.12723214285714e-09 | 0 |
| 4.12946428571428e-09 | 0 |
| 4.13169642857142e-09 | 0 |
| 4.13392857142857e-09 | 0 |
| 4.13616071428571e-09 | 0 |
| 4.13839285714285e-09 | 0 |
| 4.140625e-09 | 0 |
| 4.14285714285714e-09 | 0 |
| 4.14508928571428e-09 | 0 |
| 4.14732142857142e-09 | 0 |
| 4.14955357142857e-09 | 0 |
| 4.15178571428571e-09 | 0 |
| 4.15401785714285e-09 | 0 |
| 4.15624999999999e-09 | 0 |
| 4.15848214285714e-09 | 0 |
| 4.16071428571428e-09 | 0 |
| 4.16294642857142e-09 | 0 |
| 4.16517857142857e-09 | 0 |
| 4.16741071428571e-09 | 0 |
| 4.16964285714285e-09 | 0 |
| 4.17187499999999e-09 | 0 |
| 4.17410714285714e-09 | 0 |
| 4.17633928571428e-09 | 0 |
| 4.17857142857142e-09 | 0 |
| 4.18080357142857e-09 | 0 |
| 4.18303571428571e-09 | 0 |
| 4.18526785714285e-09 | 0 |
| 4.1875e-09 | 0 |
| 4.18973214285714e-09 | 0 |
| 4.19196428571428e-09 | 0 |
| 4.19419642857142e-09 | 0 |
| 4.19642857142857e-09 | 0 |
| 4.19866071428571e-09 | 0 |
| 4.20089285714285e-09 | 0 |
| 4.20312499999999e-09 | 0 |
| 4.20535714285714e-09 | 0 |
| 4.20758928571428e-09 | 0 |
| 4.20982142857142e-09 | 0 |
| 4.21205357142857e-09 | 0 |
| 4.21428571428571e-09 | 0 |
| 4.21651785714285e-09 | 0 |
| 4.21875e-09 | 0 |
| 4.22098214285714e-09 | 0 |
| 4.22321428571428e-09 | 0 |
| 4.22544642857142e-09 | 0 |
| 4.22767857142857e-09 | 0 |
| 4.22991071428571e-09 | 0 |
| 4.23214285714285e-09 | 0 |
| 4.23437499999999e-09 | 0 |
| 4.23660714285714e-09 | 0 |
| 4.23883928571428e-09 | 0 |
| 4.24107142857142e-09 | 0 |
| 4.24330357142857e-09 | 0 |
| 4.24553571428571e-09 | 0 |
| 4.24776785714285e-09 | 0 |
| 4.25e-09 | 0 |
| 4.25223214285714e-09 | 0 |
| 4.25446428571428e-09 | 0 |
| 4.25669642857142e-09 | 0 |
| 4.25892857142857e-09 | 0 |
| 4.26116071428571e-09 | 0 |
| 4.26339285714285e-09 | 0 |
| 4.26562499999999e-09 | 0 |
| 4.26785714285714e-09 | 0 |
| 4.27008928571428e-09 | 0 |
| 4.27232142857142e-09 | 0 |
| 4.27455357142857e-09 | 0 |
| 4.27678571428571e-09 | 0 |
| 4.27901785714285e-09 | 0 |
| 4.28124999999999e-09 | 0 |
| 4.28348214285714e-09 | 0 |
| 4.28571428571428e-09 | 0 |
| 4.28794642857142e-09 | 0 |
| 4.29017857142857e-09 | 0 |
| 4.29241071428571e-09 | 0 |
| 4.29464285714285e-09 | 0 |
| 4.296875e-09 | 0 |
| 4.29910714285714e-09 | 0 |
| 4.30133928571428e-09 | 0 |
| 4.30357142857142e-09 | 0 |
| 4.30580357142857e-09 | 0 |
| 4.30803571428571e-09 | 0 |
| 4.31026785714285e-09 | 0 |
| 4.31249999999999e-09 | 0 |
| 4.31473214285714e-09 | 0 |
| 4.31696428571428e-09 | 0 |
| 4.31919642857142e-09 | 0 |
| 4.32142857142857e-09 | 0 |
| 4.32366071428571e-09 | 0 |
| 4.32589285714285e-09 | 0 |
| 4.328125e-09 | 0 |
| 4.33035714285714e-09 | 0 |
| 4.33258928571428e-09 | 0 |
| 4.33482142857142e-09 | 0 |
| 4.33705357142857e-09 | 0 |
| 4.33928571428571e-09 | 0 |
| 4.34151785714285e-09 | 0 |
| 4.34374999999999e-09 | 0 |
| 4.34598214285714e-09 | 0 |
| 4.34821428571428e-09 | 0 |
| 4.35044642857142e-09 | 0 |
| 4.35267857142857e-09 | 0 |
| 4.35491071428571e-09 | 0 |
| 4.35714285714285e-09 | 0 |
| 4.359375e-09 | 0 |
| 4.36160714285714e-09 | 0 |
| 4.36383928571428e-09 | 0 |
| 4.36607142857142e-09 | 0 |
| 4.36830357142857e-09 | 0 |
| 4.37053571428571e-09 | 0 |
| 4.37276785714285e-09 | 0 |
| 4.375e-09 | 0 |
| 4.37723214285714e-09 | 0 |
| 4.37946428571428e-09 | 0 |
| 4.38169642857142e-09 | 0 |
| 4.38392857142857e-09 | 0 |
| 4.38616071428571e-09 | 0 |
| 4.38839285714285e-09 | 0 |
| 4.39062499999999e-09 | 0 |
| 4.39285714285714e-09 | 0 |
| 4.39508928571428e-09 | 0 |
| 4.39732142857142e-09 | 0 |
| 4.39955357142857e-09 | 0 |
| 4.40178571428571e-09 | 0 |
| 4.40401785714285e-09 | 0 |
| 4.40625e-09 | 0 |
| 4.40848214285714e-09 | 0 |
| 4.41071428571428e-09 | 0 |
| 4.41294642857142e-09 | 0 |
| 4.41517857142857e-09 | 0 |
| 4.41741071428571e-09 | 0 |
| 4.41964285714285e-09 | 0 |
| 4.42187499999999e-09 | 0 |
| 4.42410714285714e-09 | 0 |
| 4.42633928571428e-09 | 0 |
| 4.42857142857142e-09 | 0 |
| 4.43080357142857e-09 | 0 |
| 4.43303571428571e-09 | 0 |
| 4.43526785714285e-09 | 0 |
| 4.4375e-09 | 0 |
| 4.43973214285714e-09 | 0 |
| 4.44196428571428e-09 | 0 |
| 4.44419642857142e-09 | 0 |
| 4.44642857142857e-09 | 0 |
| 4.44866071428571e-09 | 0 |
| 4.45089285714285e-09 | 0 |
| 4.45312499999999e-09 | 0 |
| 4.45535714285714e-09 | 0 |
| 4.45758928571428e-09 | 0 |
| 4.45982142857142e-09 | 0 |
| 4.46205357142857e-09 | 0 |
| 4.46428571428571e-09 | 0 |
| 4.46651785714285e-09 | 0 |
| 4.46874999999999e-09 | 0 |
| 4.47098214285714e-09 | 0 |
| 4.47321428571428e-09 | 0 |
| 4.47544642857142e-09 | 0 |
| 4.47767857142857e-09 | 0 |
| 4.47991071428571e-09 | 0 |
| 4.48214285714285e-09 | 0 |
| 4.484375e-09 | 0 |
| 4.48660714285714e-09 | 0 |
| 4.48883928571428e-09 | 0 |
| 4.49107142857142e-09 | 0 |
| 4.49330357142857e-09 | 0 |
| 4.49553571428571e-09 | 0 |
| 4.49776785714285e-09 | 0 |
| 4.49999999999999e-09 | 0 |
| 4.50223214285714e-09 | 0 |
| 4.50446428571428e-09 | 0 |
| 4.50669642857142e-09 | 0 |
| 4.50892857142857e-09 | 0 |
| 4.51116071428571e-09 | 0 |
| 4.51339285714285e-09 | 0 |
| 4.515625e-09 | 0 |
| 4.51785714285714e-09 | 0 |
| 4.52008928571428e-09 | 0 |
| 4.52232142857142e-09 | 0 |
| 4.52455357142857e-09 | 0 |
| 4.52678571428571e-09 | 0 |
| 4.52901785714285e-09 | 0 |
| 4.53124999999999e-09 | 0 |
| 4.53348214285714e-09 | 0 |
| 4.53571428571428e-09 | 0 |
| 4.53794642857142e-09 | 0 |
| 4.54017857142857e-09 | 0 |
| 4.54241071428571e-09 | 0 |
| 4.54464285714285e-09 | 0 |
| 4.546875e-09 | 0 |
| 4.54910714285714e-09 | 0 |
| 4.55133928571428e-09 | 0 |
| 4.55357142857142e-09 | 0 |
| 4.55580357142857e-09 | 0 |
| 4.55803571428571e-09 | 0 |
| 4.56026785714285e-09 | 0 |
| 4.5625e-09 | 0 |
| 4.56473214285714e-09 | 0 |
| 4.56696428571428e-09 | 0 |
| 4.56919642857142e-09 | 0 |
| 4.57142857142857e-09 | 0 |
| 4.57366071428571e-09 | 0 |
| 4.57589285714285e-09 | 0 |
| 4.57812499999999e-09 | 0 |
| 4.58035714285714e-09 | 0 |
| 4.58258928571428e-09 | 0 |
| 4.58482142857142e-09 | 0 |
| 4.58705357142857e-09 | 0 |
| 4.58928571428571e-09 | 0 |
| 4.59151785714285e-09 | 0 |
| 4.59375e-09 | 0 |
| 4.59598214285714e-09 | 0 |
| 4.59821428571428e-09 | 0 |
| 4.60044642857142e-09 | 0 |
| 4.60267857142857e-09 | 0 |
| 4.60491071428571e-09 | 0 |
| 4.60714285714285e-09 | 0 |
| 4.60937499999999e-09 | 0 |
| 4.61160714285714e-09 | 0 |
| 4.61383928571428e-09 | 0 |
| 4.61607142857142e-09 | 0 |
| 4.61830357142857e-09 | 0 |
| 4.62053571428571e-09 | 0 |
| 4.62276785714285e-09 | 0 |
| 4.625e-09 | 0 |
| 4.62723214285714e-09 | 0 |
| 4.62946428571428e-09 | 0 |
| 4.63169642857142e-09 | 0 |
| 4.63392857142857e-09 | 0 |
| 4.63616071428571e-09 | 0 |
| 4.63839285714285e-09 | 0 |
| 4.64062499999999e-09 | 0 |
| 4.64285714285714e-09 | 0 |
| 4.64508928571428e-09 | 0 |
| 4.64732142857142e-09 | 0 |
| 4.64955357142857e-09 | 0 |
| 4.65178571428571e-09 | 0 |
| 4.65401785714285e-09 | 0 |
| 4.65624999999999e-09 | 0 |
| 4.65848214285714e-09 | 0 |
| 4.66071428571428e-09 | 0 |
| 4.66294642857142e-09 | 0 |
| 4.66517857142857e-09 | 0 |
| 4.66741071428571e-09 | 0 |
| 4.66964285714285e-09 | 0 |
| 4.671875e-09 | 0 |
| 4.67410714285714e-09 | 0 |
| 4.67633928571428e-09 | 0 |
| 4.67857142857142e-09 | 0 |
| 4.68080357142857e-09 | 0 |
| 4.68303571428571e-09 | 0 |
| 4.68526785714285e-09 | 0 |
| 4.68749999999999e-09 | 0 |
| 4.68973214285714e-09 | 0 |
| 4.69196428571428e-09 | 0 |
| 4.69419642857142e-09 | 0 |
| 4.69642857142857e-09 | 0 |
| 4.69866071428571e-09 | 0 |
| 4.70089285714285e-09 | 0 |
| 4.703125e-09 | 0 |
| 4.70535714285714e-09 | 0 |
| 4.70758928571428e-09 | 0 |
| 4.70982142857142e-09 | 0 |
| 4.71205357142857e-09 | 0 |
| 4.71428571428571e-09 | 0 |
| 4.71651785714285e-09 | 0 |
| 4.71874999999999e-09 | 0 |
| 4.72098214285714e-09 | 0 |
| 4.72321428571428e-09 | 0 |
| 4.72544642857142e-09 | 0 |
| 4.72767857142857e-09 | 0 |
| 4.72991071428571e-09 | 0 |
| 4.73214285714285e-09 | 0 |
| 4.734375e-09 | 0 |
| 4.73660714285714e-09 | 0 |
| 4.73883928571428e-09 | 0 |
| 4.74107142857142e-09 | 0 |
| 4.74330357142857e-09 | 0 |
| 4.74553571428571e-09 | 0 |
| 4.74776785714285e-09 | 0 |
| 4.74999999999999e-09 | 0 |
| 4.75223214285714e-09 | 0 |
| 4.75446428571428e-09 | 0 |
| 4.75669642857142e-09 | 0 |
| 4.75892857142857e-09 | 0 |
| 4.76116071428571e-09 | 0 |
| 4.76339285714285e-09 | 0 |
| 4.76562499999999e-09 | 0 |
| 4.76785714285714e-09 | 0 |
| 4.77008928571428e-09 | 0 |
| 4.77232142857142e-09 | 0 |
| 4.77455357142857e-09 | 0 |
| 4.77678571428571e-09 | 0 |
| 4.77901785714285e-09 | 0 |
| 4.78125e-09 | 0 |
| 4.78348214285714e-09 | 0 |
| 4.78571428571428e-09 | 0 |
| 4.78794642857142e-09 | 0 |
| 4.79017857142857e-09 | 0 |
| 4.79241071428571e-09 | 0 |
| 4.79464285714285e-09 | 0 |
| 4.79687499999999e-09 | 0 |
| 4.79910714285714e-09 | 0 |
| 4.80133928571428e-09 | 0 |
| 4.80357142857142e-09 | 0 |
| 4.80580357142857e-09 | 0 |
| 4.80803571428571e-09 | 0 |
| 4.81026785714285e-09 | 0 |
| 4.8125e-09 | 0 |
| 4.81473214285714e-09 | 0 |
| 4.81696428571428e-09 | 0 |
| 4.81919642857142e-09 | 0 |
| 4.82142857142857e-09 | 0 |
| 4.82366071428571e-09 | 0 |
| 4.82589285714285e-09 | 0 |
| 4.82812499999999e-09 | 0 |
| 4.83035714285714e-09 | 0 |
| 4.83258928571428e-09 | 0 |
| 4.83482142857142e-09 | 0 |
| 4.83705357142857e-09 | 0 |
| 4.83928571428571e-09 | 0 |
| 4.84151785714285e-09 | 0 |
| 4.84374999999999e-09 | 0 |
| 4.84598214285714e-09 | 0 |
| 4.84821428571428e-09 | 0 |
| 4.85044642857142e-09 | 0 |
| 4.85267857142857e-09 | 0 |
| 4.85491071428571e-09 | 0 |
| 4.85714285714285e-09 | 0 |
| 4.859375e-09 | 0 |
| 4.86160714285714e-09 | 0 |
| 4.86383928571428e-09 | 0 |
| 4.86607142857142e-09 | 0 |
| 4.86830357142857e-09 | 0 |
| 4.87053571428571e-09 | 0 |
| 4.87276785714285e-09 | 0 |
| 4.87499999999999e-09 | 0 |
| 4.87723214285714e-09 | 0 |
| 4.87946428571428e-09 | 0 |
| 4.88169642857142e-09 | 0 |
| 4.88392857142857e-09 | 0 |
| 4.88616071428571e-09 | 0 |
| 4.88839285714285e-09 | 0 |
| 4.890625e-09 | 0 |
| 4.89285714285714e-09 | 0 |
| 4.89508928571428e-09 | 0 |
| 4.89732142857142e-09 | 0 |
| 4.89955357142857e-09 | 0 |
| 4.90178571428571e-09 | 0 |
| 4.90401785714285e-09 | 0 |
| 4.90624999999999e-09 | 0 |
| 4.90848214285714e-09 | 0 |
| 4.91071428571428e-09 | 0 |
| 4.91294642857142e-09 | 0 |
| 4.91517857142857e-09 | 0 |
| 4.91741071428571e-09 | 0 |
| 4.91964285714285e-09 | 0 |
| 4.921875e-09 | 0 |
| 4.92410714285714e-09 | 0 |
| 4.92633928571428e-09 | 0 |
| 4.92857142857142e-09 | 0 |
| 4.93080357142857e-09 | 0 |
| 4.93303571428571e-09 | 0 |
| 4.93526785714285e-09 | 0 |
| 4.93749999999999e-09 | 0 |
| 4.93973214285714e-09 | 0 |
| 4.94196428571428e-09 | 0 |
| 4.94419642857142e-09 | 0 |
| 4.94642857142857e-09 | 0 |
| 4.94866071428571e-09 | 0 |
| 4.95089285714285e-09 | 0 |
| 4.95312499999999e-09 | 0 |
| 4.95535714285714e-09 | 0 |
| 4.95758928571428e-09 | 0 |
| 4.95982142857142e-09 | 0 |
| 4.96205357142857e-09 | 0 |
| 4.96428571428571e-09 | 0 |
| 4.96651785714285e-09 | 0 |
| 4.96875e-09 | 0 |
| 4.97098214285714e-09 | 0 |
| 4.97321428571428e-09 | 0 |
| 4.97544642857142e-09 | 0 |
| 4.97767857142857e-09 | 0 |
| 4.97991071428571e-09 | 0 |
| 4.98214285714285e-09 | 0 |
| 4.98437499999999e-09 | 0 |
| 4.98660714285714e-09 | 0 |
| 4.98883928571428e-09 | 0 |
| 4.99107142857142e-09 | 0 |
| 4.99330357142857e-09 | 0 |
| 4.99553571428571e-09 | 0 |
| 4.99776785714285e-09 | 0 |
| 5e-09 | 0 |
| 5.00223214285714e-09 | 0 |
| 5.00446428571428e-09 | 0 |
| 5.00669642857142e-09 | 0 |
| 5.00892857142857e-09 | 0 |
| 5.01116071428571e-09 | 0 |
| 5.01339285714285e-09 | 0 |
| 5.01562499999999e-09 | 0 |
| 5.01785714285714e-09 | 0 |
| 5.02008928571428e-09 | 0 |
| 5.02232142857142e-09 | 0 |
| 5.02455357142857e-09 | 0 |
| 5.02678571428571e-09 | 0 |
| 5.02901785714285e-09 | 0 |
| 5.03125e-09 | 0 |
| 5.03348214285714e-09 | 0 |
| 5.03571428571428e-09 | 0 |
| 5.03794642857142e-09 | 0 |
| 5.04017857142857e-09 | 0 |
| 5.04241071428571e-09 | 0 |
| 5.04464285714285e-09 | 0 |
| 5.046875e-09 | 0 |
| 5.04910714285714e-09 | 0 |
| 5.05133928571428e-09 | 0 |
| 5.05357142857142e-09 | 0 |
| 5.05580357142857e-09 | 0 |
| 5.05803571428571e-09 | 0 |
| 5.06026785714285e-09 | 0 |
| 5.06249999999999e-09 | 0 |
| 5.06473214285714e-09 | 0 |
| 5.06696428571428e-09 | 0 |
| 5.06919642857142e-09 | 0 |
| 5.07142857142857e-09 | 0 |
| 5.07366071428571e-09 | 0 |
| 5.07589285714285e-09 | 0 |
| 5.078125e-09 | 0 |
| 5.08035714285714e-09 | 0 |
| 5.08258928571428e-09 | 0 |
| 5.08482142857142e-09 | 0 |
| 5.08705357142857e-09 | 0 |
| 5.08928571428571e-09 | 0 |
| 5.09151785714285e-09 | 0 |
| 5.09374999999999e-09 | 0 |
| 5.09598214285714e-09 | 0 |
| 5.09821428571428e-09 | 0 |
| 5.10044642857142e-09 | 0 |
| 5.10267857142857e-09 | 0 |
| 5.10491071428571e-09 | 0 |
| 5.10714285714285e-09 | 0 |
| 5.109375e-09 | 0 |
| 5.11160714285714e-09 | 0 |
| 5.11383928571428e-09 | 0 |
| 5.11607142857142e-09 | 0 |
| 5.11830357142857e-09 | 0 |
| 5.12053571428571e-09 | 0 |
| 5.12276785714285e-09 | 0 |
| 5.12499999999999e-09 | 0 |
| 5.12723214285714e-09 | 0 |
| 5.12946428571428e-09 | 0 |
| 5.13169642857142e-09 | 0 |
| 5.13392857142857e-09 | 0 |
| 5.13616071428571e-09 | 0 |
| 5.13839285714285e-09 | 0 |
| 5.14062499999999e-09 | 0 |
| 5.14285714285714e-09 | 0 |
| 5.14508928571428e-09 | 0 |
| 5.14732142857142e-09 | 0 |
| 5.14955357142857e-09 | 0 |
| 5.15178571428571e-09 | 0 |
| 5.15401785714285e-09 | 0 |
| 5.15625e-09 | 0 |
| 5.15848214285714e-09 | 0 |
| 5.16071428571428e-09 | 0 |
| 5.16294642857142e-09 | 0 |
| 5.16517857142857e-09 | 0 |
| 5.16741071428571e-09 | 0 |
| 5.16964285714285e-09 | 0 |
| 5.17187499999999e-09 | 0 |
| 5.17410714285714e-09 | 0 |
| 5.17633928571428e-09 | 0 |
| 5.17857142857142e-09 | 0 |
| 5.18080357142857e-09 | 0 |
| 5.18303571428571e-09 | 0 |
| 5.18526785714285e-09 | 0 |
| 5.1875e-09 | 0 |
| 5.18973214285714e-09 | 0 |
| 5.19196428571428e-09 | 0 |
| 5.19419642857142e-09 | 0 |
| 5.19642857142857e-09 | 0 |
| 5.19866071428571e-09 | 0 |
| 5.20089285714285e-09 | 0 |
| 5.20312499999999e-09 | 0 |
| 5.20535714285714e-09 | 0 |
| 5.20758928571428e-09 | 0 |
| 5.20982142857142e-09 | 0 |
| 5.21205357142857e-09 | 0 |
| 5.21428571428571e-09 | 0 |
| 5.21651785714285e-09 | 0 |
| 5.21875e-09 | 0 |
| 5.22098214285714e-09 | 0 |
| 5.22321428571428e-09 | 0 |
| 5.22544642857142e-09 | 0 |
| 5.22767857142857e-09 | 0 |
| 5.22991071428571e-09 | 0 |
| 5.23214285714285e-09 | 0 |
| 5.23437499999999e-09 | 0 |
| 5.23660714285714e-09 | 0 |
| 5.23883928571428e-09 | 0 |
| 5.24107142857142e-09 | 0 |
| 5.24330357142857e-09 | 0 |
| 5.24553571428571e-09 | 0 |
| 5.24776785714285e-09 | 0 |
| 5.24999999999999e-09 | 0 |
| 5.25223214285714e-09 | 0 |
| 5.25446428571428e-09 | 0 |
| 5.25669642857142e-09 | 0 |
| 5.25892857142857e-09 | 0 |
| 5.26116071428571e-09 | 0 |
| 5.26339285714285e-09 | 0 |
| 5.265625e-09 | 0 |
| 5.26785714285714e-09 | 0 |
| 5.27008928571428e-09 | 0 |
| 5.27232142857142e-09 | 0 |
| 5.27455357142857e-09 | 0 |
| 5.27678571428571e-09 | 0 |
| 5.27901785714285e-09 | 0 |
| 5.28124999999999e-09 | 0 |
| 5.28348214285714e-09 | 0 |
| 5.28571428571428e-09 | 0 |
| 5.28794642857142e-09 | 0 |
| 5.29017857142857e-09 | 0 |
| 5.29241071428571e-09 | 0 |
| 5.29464285714285e-09 | 0 |
| 5.296875e-09 | 0 |
| 5.29910714285714e-09 | 0 |
| 5.30133928571428e-09 | 0 |
| 5.30357142857142e-09 | 0 |
| 5.30580357142857e-09 | 0 |
| 5.30803571428571e-09 | 0 |
| 5.31026785714285e-09 | 0 |
| 5.31249999999999e-09 | 0 |
| 5.31473214285714e-09 | 0 |
| 5.31696428571428e-09 | 0 |
| 5.31919642857142e-09 | 0 |
| 5.32142857142857e-09 | 0 |
| 5.32366071428571e-09 | 0 |
| 5.32589285714285e-09 | 0 |
| 5.32812499999999e-09 | 0 |
| 5.33035714285714e-09 | 0 |
| 5.33258928571428e-09 | 0 |
| 5.33482142857142e-09 | 0 |
| 5.33705357142857e-09 | 0 |
| 5.33928571428571e-09 | 0 |
| 5.34151785714285e-09 | 0 |
| 5.34375e-09 | 0 |
| 5.34598214285714e-09 | 0 |
| 5.34821428571428e-09 | 0 |
| 5.35044642857142e-09 | 0 |
| 5.35267857142857e-09 | 0 |
| 5.35491071428571e-09 | 0 |
| 5.35714285714285e-09 | 0 |
| 5.35937499999999e-09 | 0 |
| 5.36160714285714e-09 | 0 |
| 5.36383928571428e-09 | 0 |
| 5.36607142857142e-09 | 0 |
| 5.36830357142857e-09 | 0 |
| 5.37053571428571e-09 | 0 |
| 5.37276785714285e-09 | 0 |
| 5.375e-09 | 0 |
| 5.37723214285714e-09 | 0 |
| 5.37946428571428e-09 | 0 |
| 5.38169642857142e-09 | 0 |
| 5.38392857142857e-09 | 0 |
| 5.38616071428571e-09 | 0 |
| 5.38839285714285e-09 | 0 |
| 5.39062499999999e-09 | 0 |
| 5.39285714285714e-09 | 0 |
| 5.39508928571428e-09 | 0 |
| 5.39732142857142e-09 | 0 |
| 5.39955357142857e-09 | 0 |
| 5.40178571428571e-09 | 0 |
| 5.40401785714285e-09 | 0 |
| 5.40625e-09 | 0 |
| 5.40848214285714e-09 | 0 |
| 5.41071428571428e-09 | 0 |
| 5.41294642857142e-09 | 0 |
| 5.41517857142857e-09 | 0 |
| 5.41741071428571e-09 | 0 |
| 5.41964285714285e-09 | 0 |
| 5.42187499999999e-09 | 0 |
| 5.42410714285714e-09 | 0 |
| 5.42633928571428e-09 | 0 |
| 5.42857142857142e-09 | 0 |
| 5.43080357142857e-09 | 0 |
| 5.43303571428571e-09 | 0 |
| 5.43526785714285e-09 | 0 |
| 5.43749999999999e-09 | 0 |
| 5.43973214285714e-09 | 0 |
| 5.44196428571428e-09 | 0 |
| 5.44419642857142e-09 | 0 |
| 5.44642857142857e-09 | 0 |
| 5.44866071428571e-09 | 0 |
| 5.45089285714285e-09 | 0 |
| 5.453125e-09 | 0 |
| 5.45535714285714e-09 | 0 |
| 5.45758928571428e-09 | 0 |
| 5.45982142857142e-09 | 0 |
| 5.46205357142857e-09 | 0 |
| 5.46428571428571e-09 | 0 |
| 5.46651785714285e-09 | 0 |
| 5.46874999999999e-09 | 0 |
| 5.47098214285714e-09 | 0 |
| 5.47321428571428e-09 | 0 |
| 5.47544642857142e-09 | 0 |
| 5.47767857142857e-09 | 0 |
| 5.47991071428571e-09 | 0 |
| 5.48214285714285e-09 | 0 |
| 5.484375e-09 | 0 |
| 5.48660714285714e-09 | 0 |
| 5.48883928571428e-09 | 0 |
| 5.49107142857142e-09 | 0 |
| 5.49330357142857e-09 | 0 |
| 5.49553571428571e-09 | 0 |
| 5.49776785714285e-09 | 0 |
| 5.49999999999999e-09 | 0 |
| 5.50223214285714e-09 | 0 |
| 5.50446428571428e-09 | 0 |
| 5.50669642857142e-09 | 0 |
| 5.50892857142857e-09 | 0 |
| 5.51116071428571e-09 | 0 |
| 5.51339285714285e-09 | 0 |
| 5.515625e-09 | 0 |
| 5.51785714285714e-09 | 0 |
| 5.52008928571428e-09 | 0 |
| 5.52232142857142e-09 | 0 |
| 5.52455357142857e-09 | 0 |
| 5.52678571428571e-09 | 0 |
| 5.52901785714285e-09 | 0 |
| 5.53125e-09 | 0 |
| 5.53348214285714e-09 | 0 |
| 5.53571428571428e-09 | 0 |
| 5.53794642857142e-09 | 0 |
| 5.54017857142857e-09 | 0 |
| 5.54241071428571e-09 | 0 |
| 5.54464285714285e-09 | 0 |
| 5.54687499999999e-09 | 0 |
| 5.54910714285714e-09 | 0 |
| 5.55133928571428e-09 | 0 |
| 5.55357142857142e-09 | 0 |
| 5.55580357142857e-09 | 0 |
| 5.55803571428571e-09 | 0 |
| 5.56026785714285e-09 | 0 |
| 5.5625e-09 | 0 |
| 5.56473214285714e-09 | 0 |
| 5.56696428571428e-09 | 0 |
| 5.56919642857142e-09 | 0 |
| 5.57142857142857e-09 | 0 |
| 5.57366071428571e-09 | 0 |
| 5.57589285714285e-09 | 0 |
| 5.57812499999999e-09 | 0 |
| 5.58035714285714e-09 | 0 |
| 5.58258928571428e-09 | 0 |
| 5.58482142857142e-09 | 0 |
| 5.58705357142857e-09 | 0 |
| 5.58928571428571e-09 | 0 |
| 5.59151785714285e-09 | 0 |
| 5.59375e-09 | 0 |
| 5.59598214285714e-09 | 0 |
| 5.59821428571428e-09 | 0 |
| 5.60044642857142e-09 | 0 |
| 5.60267857142857e-09 | 0 |
| 5.60491071428571e-09 | 0 |
| 5.60714285714285e-09 | 0 |
| 5.60937499999999e-09 | 0 |
| 5.61160714285714e-09 | 0 |
| 5.61383928571428e-09 | 0 |
| 5.61607142857142e-09 | 0 |
| 5.61830357142857e-09 | 0 |
| 5.62053571428571e-09 | 0 |
| 5.62276785714285e-09 | 0 |
| 5.62499999999999e-09 | 0 |
| 5.62723214285714e-09 | 0 |
| 5.62946428571428e-09 | 0 |
| 5.63169642857142e-09 | 0 |
| 5.63392857142857e-09 | 0 |
| 5.63616071428571e-09 | 0 |
| 5.63839285714285e-09 | 0 |
| 5.640625e-09 | 0 |
| 5.64285714285714e-09 | 0 |
| 5.64508928571428e-09 | 0 |
| 5.64732142857142e-09 | 0 |
| 5.64955357142857e-09 | 0 |
| 5.65178571428571e-09 | 0 |
| 5.65401785714285e-09 | 0 |
| 5.65624999999999e-09 | 0 |
| 5.65848214285714e-09 | 0 |
| 5.66071428571428e-09 | 0 |
| 5.66294642857142e-09 | 0 |
| 5.66517857142857e-09 | 0 |
| 5.66741071428571e-09 | 0 |
| 5.66964285714285e-09 | 0 |
| 5.671875e-09 | 0 |
| 5.67410714285714e-09 | 0 |
| 5.67633928571428e-09 | 0 |
| 5.67857142857142e-09 | 0 |
| 5.68080357142857e-09 | 0 |
| 5.68303571428571e-09 | 0 |
| 5.68526785714285e-09 | 0 |
| 5.68749999999999e-09 | 0 |
| 5.68973214285714e-09 | 0 |
| 5.69196428571428e-09 | 0 |
| 5.69419642857142e-09 | 0 |
| 5.69642857142857e-09 | 0 |
| 5.69866071428571e-09 | 0 |
| 5.70089285714285e-09 | 0 |
| 5.703125e-09 | 0 |
| 5.70535714285714e-09 | 0 |
| 5.70758928571428e-09 | 0 |
| 5.70982142857142e-09 | 0 |
| 5.71205357142857e-09 | 0 |
| 5.71428571428571e-09 | 0 |
| 5.71651785714285e-09 | 0 |
| 5.71874999999999e-09 | 0 |
| 5.72098214285714e-09 | 0 |
| 5.72321428571428e-09 | 0 |
| 5.72544642857142e-09 | 0 |
| 5.72767857142857e-09 | 0 |
| 5.72991071428571e-09 | 0 |
| 5.73214285714285e-09 | 0 |
| 5.73437499999999e-09 | 0 |
| 5.73660714285714e-09 | 0 |
| 5.73883928571428e-09 | 0 |
| 5.74107142857142e-09 | 0 |
| 5.74330357142857e-09 | 0 |
| 5.74553571428571e-09 | 0 |
| 5.74776785714285e-09 | 0 |
| 5.75e-09 | 0 |
| 5.75223214285714e-09 | 0 |
| 5.75446428571428e-09 | 0 |
| 5.75669642857142e-09 | 0 |
| 5.75892857142857e-09 | 0 |
| 5.76116071428571e-09 | 0 |
| 5.76339285714285e-09 | 0 |
| 5.76562499999999e-09 | 0 |
| 5.76785714285714e-09 | 0 |
| 5.77008928571428e-09 | 0 |
| 5.77232142857142e-09 | 0 |
| 5.77455357142857e-09 | 0 |
| 5.77678571428571e-09 | 0 |
| 5.77901785714285e-09 | 0 |
| 5.78125e-09 | 0 |
| 5.78348214285714e-09 | 0 |
| 5.78571428571428e-09 | 0 |
| 5.78794642857142e-09 | 0 |
| 5.79017857142857e-09 | 0 |
| 5.79241071428571e-09 | 0 |
| 5.79464285714285e-09 | 0 |
| 5.79687499999999e-09 | 0 |
| 5.79910714285714e-09 | 0 |
| 5.80133928571428e-09 | 0 |
| 5.80357142857142e-09 | 0 |
| 5.80580357142857e-09 | 0 |
| 5.80803571428571e-09 | 0 |
| 5.81026785714285e-09 | 0 |
| 5.81249999999999e-09 | 0 |
| 5.81473214285714e-09 | 0 |
| 5.81696428571428e-09 | 0 |
| 5.81919642857142e-09 | 0 |
| 5.82142857142857e-09 | 0 |
| 5.82366071428571e-09 | 0 |
| 5.82589285714285e-09 | 0 |
| 5.828125e-09 | 0 |
| 5.83035714285714e-09 | 0 |
| 5.83258928571428e-09 | 0 |
| 5.83482142857142e-09 | 0 |
| 5.83705357142857e-09 | 0 |
| 5.83928571428571e-09 | 0 |
| 5.84151785714285e-09 | 0 |
| 5.84374999999999e-09 | 0 |
| 5.84598214285714e-09 | 0 |
| 5.84821428571428e-09 | 0 |
| 5.85044642857142e-09 | 0 |
| 5.85267857142857e-09 | 0 |
| 5.85491071428571e-09 | 0 |
| 5.85714285714285e-09 | 0 |
| 5.859375e-09 | 0 |
| 5.86160714285714e-09 | 0 |
| 5.86383928571428e-09 | 0 |
| 5.86607142857142e-09 | 0 |
| 5.86830357142857e-09 | 0 |
| 5.87053571428571e-09 | 0 |
| 5.87276785714285e-09 | 0 |
| 5.87499999999999e-09 | 0 |
| 5.87723214285714e-09 | 0 |
| 5.87946428571428e-09 | 0 |
| 5.88169642857142e-09 | 0 |
| 5.88392857142857e-09 | 0 |
| 5.88616071428571e-09 | 0 |
| 5.88839285714285e-09 | 0 |
| 5.890625e-09 | 0 |
| 5.89285714285714e-09 | 0 |
| 5.89508928571428e-09 | 0 |
| 5.89732142857142e-09 | 0 |
| 5.89955357142857e-09 | 0 |
| 5.90178571428571e-09 | 0 |
| 5.90401785714285e-09 | 0 |
| 5.90624999999999e-09 | 0 |
| 5.90848214285714e-09 | 0 |
| 5.91071428571428e-09 | 0 |
| 5.91294642857142e-09 | 0 |
| 5.91517857142857e-09 | 0 |
| 5.91741071428571e-09 | 0 |
| 5.91964285714285e-09 | 0 |
| 5.92187499999999e-09 | 0 |
| 5.92410714285714e-09 | 0 |
| 5.92633928571428e-09 | 0 |
| 5.92857142857142e-09 | 0 |
| 5.93080357142857e-09 | 0 |
| 5.93303571428571e-09 | 0 |
| 5.93526785714285e-09 | 0 |
| 5.9375e-09 | 0 |
| 5.93973214285714e-09 | 0 |
| 5.94196428571428e-09 | 0 |
| 5.94419642857142e-09 | 0 |
| 5.94642857142857e-09 | 0 |
| 5.94866071428571e-09 | 0 |
| 5.95089285714285e-09 | 0 |
| 5.95312499999999e-09 | 0 |
| 5.95535714285714e-09 | 0 |
| 5.95758928571428e-09 | 0 |
| 5.95982142857142e-09 | 0 |
| 5.96205357142857e-09 | 0 |
| 5.96428571428571e-09 | 0 |
| 5.96651785714285e-09 | 0 |
| 5.96875e-09 | 0 |
| 5.97098214285714e-09 | 0 |
| 5.97321428571428e-09 | 0 |
| 5.97544642857142e-09 | 0 |
| 5.97767857142857e-09 | 0 |
| 5.97991071428571e-09 | 0 |
| 5.98214285714285e-09 | 0 |
| 5.98437499999999e-09 | 0 |
| 5.98660714285714e-09 | 0 |
| 5.98883928571428e-09 | 0 |
| 5.99107142857142e-09 | 0 |
| 5.99330357142857e-09 | 0 |
| 5.99553571428571e-09 | 0 |
| 5.99776785714285e-09 | 0 |
| 6e-09 | 0 |
| 6.00223214285714e-09 | 0 |
| 6.00446428571428e-09 | 0 |
| 6.00669642857142e-09 | 0 |
| 6.00892857142857e-09 | 0 |
| 6.01116071428571e-09 | 0 |
| 6.01339285714285e-09 | 0 |
| 6.015625e-09 | 0 |
| 6.01785714285714e-09 | 0 |
| 6.02008928571428e-09 | 0 |
| 6.02232142857142e-09 | 0 |
| 6.02455357142857e-09 | 0 |
| 6.02678571428571e-09 | 0 |
| 6.02901785714285e-09 | 0 |
| 6.03124999999999e-09 | 0 |
| 6.03348214285714e-09 | 0 |
| 6.03571428571428e-09 | 0 |
| 6.03794642857142e-09 | 0 |
| 6.04017857142857e-09 | 0 |
| 6.04241071428571e-09 | 0 |
| 6.04464285714285e-09 | 0 |
| 6.046875e-09 | 0 |
| 6.04910714285714e-09 | 0 |
| 6.05133928571428e-09 | 0 |
| 6.05357142857142e-09 | 0 |
| 6.05580357142857e-09 | 0 |
| 6.05803571428571e-09 | 0 |
| 6.06026785714285e-09 | 0 |
| 6.06249999999999e-09 | 0 |
| 6.06473214285714e-09 | 0 |
| 6.06696428571428e-09 | 0 |
| 6.06919642857142e-09 | 0 |
| 6.07142857142857e-09 | 0 |
| 6.07366071428571e-09 | 0 |
| 6.07589285714285e-09 | 0 |
| 6.078125e-09 | 0 |
| 6.08035714285714e-09 | 0 |
| 6.08258928571428e-09 | 0 |
| 6.08482142857142e-09 | 0 |
| 6.08705357142857e-09 | 0 |
| 6.08928571428571e-09 | 0 |
| 6.09151785714285e-09 | 0 |
| 6.09374999999999e-09 | 0 |
| 6.09598214285714e-09 | 0 |
| 6.09821428571428e-09 | 0 |
| 6.10044642857142e-09 | 0 |
| 6.10267857142857e-09 | 0 |
| 6.10491071428571e-09 | 0 |
| 6.10714285714285e-09 | 0 |
| 6.10937499999999e-09 | 0 |
| 6.11160714285714e-09 | 0 |
| 6.11383928571428e-09 | 0 |
| 6.11607142857142e-09 | 0 |
| 6.11830357142857e-09 | 0 |
| 6.12053571428571e-09 | 0 |
| 6.12276785714285e-09 | 0 |
| 6.125e-09 | 0 |
| 6.12723214285714e-09 | 0 |
| 6.12946428571428e-09 | 0 |
| 6.13169642857142e-09 | 0 |
| 6.13392857142857e-09 | 0 |
| 6.13616071428571e-09 | 0 |
| 6.13839285714285e-09 | 0 |
| 6.14062499999999e-09 | 0 |
| 6.14285714285714e-09 | 0 |
| 6.14508928571428e-09 | 0 |
| 6.14732142857142e-09 | 0 |
| 6.14955357142857e-09 | 0 |
| 6.15178571428571e-09 | 0 |
| 6.15401785714285e-09 | 0 |
| 6.15625e-09 | 0 |
| 6.15848214285714e-09 | 0 |
| 6.16071428571428e-09 | 0 |
| 6.16294642857142e-09 | 0 |
| 6.16517857142857e-09 | 0 |
| 6.16741071428571e-09 | 0 |
| 6.16964285714285e-09 | 0 |
| 6.17187499999999e-09 | 0 |
| 6.17410714285714e-09 | 0 |
| 6.17633928571428e-09 | 0 |
| 6.17857142857142e-09 | 0 |
| 6.18080357142857e-09 | 0 |
| 6.18303571428571e-09 | 0 |
| 6.18526785714285e-09 | 0 |
| 6.1875e-09 | 0 |
| 6.18973214285714e-09 | 0 |
| 6.19196428571428e-09 | 0 |
| 6.19419642857142e-09 | 0 |
| 6.19642857142857e-09 | 0 |
| 6.19866071428571e-09 | 0 |
| 6.20089285714285e-09 | 0 |
| 6.20312499999999e-09 | 0 |
| 6.20535714285714e-09 | 0 |
| 6.20758928571428e-09 | 0 |
| 6.20982142857142e-09 | 0 |
| 6.21205357142857e-09 | 0 |
| 6.21428571428571e-09 | 0 |
| 6.21651785714285e-09 | 0 |
| 6.21874999999999e-09 | 0 |
| 6.22098214285714e-09 | 0 |
| 6.22321428571428e-09 | 0 |
| 6.22544642857142e-09 | 0 |
| 6.22767857142857e-09 | 0 |
| 6.22991071428571e-09 | 0 |
| 6.23214285714285e-09 | 0 |
| 6.234375e-09 | 0 |
| 6.23660714285714e-09 | 0 |
| 6.23883928571428e-09 | 0 |
| 6.24107142857142e-09 | 0 |
| 6.24330357142857e-09 | 0 |
| 6.24553571428571e-09 | 0 |
| 6.24776785714285e-09 | 0 |
| 6.24999999999999e-09 | 0 |
| 6.25223214285714e-09 | 0 |
| 6.25446428571428e-09 | 0 |
| 6.25669642857142e-09 | 0 |
| 6.25892857142857e-09 | 0 |
| 6.26116071428571e-09 | 0 |
| 6.26339285714285e-09 | 0 |
| 6.265625e-09 | 0 |
| 6.26785714285714e-09 | 0 |
| 6.27008928571428e-09 | 0 |
| 6.27232142857142e-09 | 0 |
| 6.27455357142857e-09 | 0 |
| 6.27678571428571e-09 | 0 |
| 6.27901785714285e-09 | 0 |
| 6.28124999999999e-09 | 0 |
| 6.28348214285714e-09 | 0 |
| 6.28571428571428e-09 | 0 |
| 6.28794642857142e-09 | 0 |
| 6.29017857142857e-09 | 0 |
| 6.29241071428571e-09 | 0 |
| 6.29464285714285e-09 | 0 |
| 6.29687499999999e-09 | 0 |
| 6.29910714285714e-09 | 0 |
| 6.30133928571428e-09 | 0 |
| 6.30357142857142e-09 | 0 |
| 6.30580357142857e-09 | 0 |
| 6.30803571428571e-09 | 0 |
| 6.31026785714285e-09 | 0 |
| 6.3125e-09 | 0 |
| 6.31473214285714e-09 | 0 |
| 6.31696428571428e-09 | 0 |
| 6.31919642857142e-09 | 0 |
| 6.32142857142857e-09 | 0 |
| 6.32366071428571e-09 | 0 |
| 6.32589285714285e-09 | 0 |
| 6.32812499999999e-09 | 0 |
| 6.33035714285714e-09 | 0 |
| 6.33258928571428e-09 | 0 |
| 6.33482142857142e-09 | 0 |
| 6.33705357142857e-09 | 0 |
| 6.33928571428571e-09 | 0 |
| 6.34151785714285e-09 | 0 |
| 6.34375e-09 | 0 |
| 6.34598214285714e-09 | 0 |
| 6.34821428571428e-09 | 0 |
| 6.35044642857142e-09 | 0 |
| 6.35267857142857e-09 | 0 |
| 6.35491071428571e-09 | 0 |
| 6.35714285714285e-09 | 0 |
| 6.35937499999999e-09 | 0 |
| 6.36160714285714e-09 | 0 |
| 6.36383928571428e-09 | 0 |
| 6.36607142857142e-09 | 0 |
| 6.36830357142857e-09 | 0 |
| 6.37053571428571e-09 | 0 |
| 6.37276785714285e-09 | 0 |
| 6.375e-09 | 0 |
| 6.37723214285714e-09 | 0 |
| 6.37946428571428e-09 | 0 |
| 6.38169642857142e-09 | 0 |
| 6.38392857142857e-09 | 0 |
| 6.38616071428571e-09 | 0 |
| 6.38839285714285e-09 | 0 |
| 6.39062499999999e-09 | 0 |
| 6.39285714285714e-09 | 0 |
| 6.39508928571428e-09 | 0 |
| 6.39732142857142e-09 | 0 |
| 6.39955357142857e-09 | 0 |
| 6.40178571428571e-09 | 0 |
| 6.40401785714285e-09 | 0 |
| 6.40624999999999e-09 | 0 |
| 6.40848214285714e-09 | 0 |
| 6.41071428571428e-09 | 0 |
| 6.41294642857142e-09 | 0 |
| 6.41517857142857e-09 | 0 |
| 6.41741071428571e-09 | 0 |
| 6.41964285714285e-09 | 0 |
| 6.421875e-09 | 0 |
| 6.42410714285714e-09 | 0 |
| 6.42633928571428e-09 | 0 |
| 6.42857142857142e-09 | 0 |
| 6.43080357142857e-09 | 0 |
| 6.43303571428571e-09 | 0 |
| 6.43526785714285e-09 | 0 |
| 6.43749999999999e-09 | 0 |
| 6.43973214285714e-09 | 0 |
| 6.44196428571428e-09 | 0 |
| 6.44419642857142e-09 | 0 |
| 6.44642857142857e-09 | 0 |
| 6.44866071428571e-09 | 0 |
| 6.45089285714285e-09 | 0 |
| 6.453125e-09 | 0 |
| 6.45535714285714e-09 | 0 |
| 6.45758928571428e-09 | 0 |
| 6.45982142857142e-09 | 0 |
| 6.46205357142857e-09 | 0 |
| 6.46428571428571e-09 | 0 |
| 6.46651785714285e-09 | 0 |
| 6.46874999999999e-09 | 0 |
| 6.47098214285714e-09 | 0 |
| 6.47321428571428e-09 | 0 |
| 6.47544642857142e-09 | 0 |
| 6.47767857142857e-09 | 0 |
| 6.47991071428571e-09 | 0 |
| 6.48214285714285e-09 | 0 |
| 6.484375e-09 | 0 |
| 6.48660714285714e-09 | 0 |
| 6.48883928571428e-09 | 0 |
| 6.49107142857142e-09 | 0 |
| 6.49330357142857e-09 | 0 |
| 6.49553571428571e-09 | 0 |
| 6.49776785714285e-09 | 0 |
| 6.5e-09 | 0 |
| 6.50223214285714e-09 | 0 |
| 6.50446428571428e-09 | 0 |
| 6.50669642857142e-09 | 0 |
| 6.50892857142857e-09 | 0 |
| 6.51116071428571e-09 | 0 |
| 6.51339285714285e-09 | 0 |
| 6.51562499999999e-09 | 0 |
| 6.51785714285714e-09 | 0 |
| 6.52008928571428e-09 | 0 |
| 6.52232142857142e-09 | 0 |
| 6.52455357142857e-09 | 0 |
| 6.52678571428571e-09 | 0 |
| 6.52901785714285e-09 | 0 |
| 6.53125e-09 | 0 |
| 6.53348214285714e-09 | 0 |
| 6.53571428571428e-09 | 0 |
| 6.53794642857142e-09 | 0 |
| 6.54017857142857e-09 | 0 |
| 6.54241071428571e-09 | 0 |
| 6.54464285714285e-09 | 0 |
| 6.54687499999999e-09 | 0 |
| 6.54910714285714e-09 | 0 |
| 6.55133928571428e-09 | 0 |
| 6.55357142857142e-09 | 0 |
| 6.55580357142857e-09 | 0 |
| 6.55803571428571e-09 | 0 |
| 6.56026785714285e-09 | 0 |
| 6.5625e-09 | 0 |
| 6.56473214285714e-09 | 0 |
| 6.56696428571428e-09 | 0 |
| 6.56919642857142e-09 | 0 |
| 6.57142857142857e-09 | 0 |
| 6.57366071428571e-09 | 0 |
| 6.57589285714285e-09 | 0 |
| 6.57812499999999e-09 | 0 |
| 6.58035714285714e-09 | 0 |
| 6.58258928571428e-09 | 0 |
| 6.58482142857142e-09 | 0 |
| 6.58705357142857e-09 | 0 |
| 6.58928571428571e-09 | 0 |
| 6.59151785714285e-09 | 0 |
| 6.59374999999999e-09 | 0 |
| 6.59598214285714e-09 | 0 |
| 6.59821428571428e-09 | 0 |
| 6.60044642857142e-09 | 0 |
| 6.60267857142857e-09 | 0 |
| 6.60491071428571e-09 | 0 |
| 6.60714285714285e-09 | 0 |
| 6.609375e-09 | 0 |
| 6.61160714285714e-09 | 0 |
| 6.61383928571428e-09 | 0 |
| 6.61607142857142e-09 | 0 |
| 6.61830357142857e-09 | 0 |
| 6.62053571428571e-09 | 0 |
| 6.62276785714285e-09 | 0 |
| 6.62499999999999e-09 | 0 |
| 6.62723214285714e-09 | 0 |
| 6.62946428571428e-09 | 0 |
| 6.63169642857142e-09 | 0 |
| 6.63392857142857e-09 | 0 |
| 6.63616071428571e-09 | 0 |
| 6.63839285714285e-09 | 0 |
| 6.640625e-09 | 0 |
| 6.64285714285714e-09 | 0 |
| 6.64508928571428e-09 | 0 |
| 6.64732142857142e-09 | 0 |
| 6.64955357142857e-09 | 0 |
| 6.65178571428571e-09 | 0 |
| 6.65401785714285e-09 | 0 |
| 6.65624999999999e-09 | 0 |
| 6.65848214285714e-09 | 0 |
| 6.66071428571428e-09 | 0 |
| 6.66294642857142e-09 | 0 |
| 6.66517857142857e-09 | 0 |
| 6.66741071428571e-09 | 0 |
| 6.66964285714285e-09 | 0 |
| 6.671875e-09 | 0 |
| 6.67410714285714e-09 | 0 |
| 6.67633928571428e-09 | 0 |
| 6.67857142857142e-09 | 0 |
| 6.68080357142857e-09 | 0 |
| 6.68303571428571e-09 | 0 |
| 6.68526785714285e-09 | 0 |
| 6.68749999999999e-09 | 0 |
| 6.68973214285714e-09 | 0 |
| 6.69196428571428e-09 | 0 |
| 6.69419642857142e-09 | 0 |
| 6.69642857142857e-09 | 0 |
| 6.69866071428571e-09 | 0 |
| 6.70089285714285e-09 | 0 |
| 6.70312499999999e-09 | 0 |
| 6.70535714285714e-09 | 0 |
| 6.70758928571428e-09 | 0 |
| 6.70982142857142e-09 | 0 |
| 6.71205357142857e-09 | 0 |
| 6.71428571428571e-09 | 0 |
| 6.71651785714285e-09 | 0 |
| 6.71875e-09 | 0 |
| 6.72098214285714e-09 | 0 |
| 6.72321428571428e-09 | 0 |
| 6.72544642857142e-09 | 0 |
| 6.72767857142857e-09 | 0 |
| 6.72991071428571e-09 | 0 |
| 6.73214285714285e-09 | 0 |
| 6.73437499999999e-09 | 0 |
| 6.73660714285714e-09 | 0 |
| 6.73883928571428e-09 | 0 |
| 6.74107142857142e-09 | 0 |
| 6.74330357142857e-09 | 0 |
| 6.74553571428571e-09 | 0 |
| 6.74776785714285e-09 | 0 |
| 6.75e-09 | 0 |
| 6.75223214285714e-09 | 0 |
| 6.75446428571428e-09 | 0 |
| 6.75669642857142e-09 | 0 |
| 6.75892857142857e-09 | 0 |
| 6.76116071428571e-09 | 0 |
| 6.76339285714285e-09 | 0 |
| 6.76562499999999e-09 | 0 |
| 6.76785714285714e-09 | 0 |
| 6.77008928571428e-09 | 0 |
| 6.77232142857142e-09 | 0 |
| 6.77455357142857e-09 | 0 |
| 6.77678571428571e-09 | 0 |
| 6.77901785714285e-09 | 0 |
| 6.78124999999999e-09 | 0 |
| 6.78348214285714e-09 | 0 |
| 6.78571428571428e-09 | 0 |
| 6.78794642857142e-09 | 0 |
| 6.79017857142857e-09 | 0 |
| 6.79241071428571e-09 | 0 |
| 6.79464285714285e-09 | 0 |
| 6.796875e-09 | 0 |
| 6.79910714285714e-09 | 0 |
| 6.80133928571428e-09 | 0 |
| 6.80357142857142e-09 | 0 |
| 6.80580357142857e-09 | 0 |
| 6.80803571428571e-09 | 0 |
| 6.81026785714285e-09 | 0 |
| 6.81249999999999e-09 | 0 |
| 6.81473214285714e-09 | 0 |
| 6.81696428571428e-09 | 0 |
| 6.81919642857142e-09 | 0 |
| 6.82142857142857e-09 | 0 |
| 6.82366071428571e-09 | 0 |
| 6.82589285714285e-09 | 0 |
| 6.828125e-09 | 0 |
| 6.83035714285714e-09 | 0 |
| 6.83258928571428e-09 | 0 |
| 6.83482142857142e-09 | 0 |
| 6.83705357142857e-09 | 0 |
| 6.83928571428571e-09 | 0 |
| 6.84151785714285e-09 | 0 |
| 6.84374999999999e-09 | 0 |
| 6.84598214285714e-09 | 0 |
| 6.84821428571428e-09 | 0 |
| 6.85044642857142e-09 | 0 |
| 6.85267857142857e-09 | 0 |
| 6.85491071428571e-09 | 0 |
| 6.85714285714285e-09 | 0 |
| 6.859375e-09 | 0 |
| 6.86160714285714e-09 | 0 |
| 6.86383928571428e-09 | 0 |
| 6.86607142857142e-09 | 0 |
| 6.86830357142857e-09 | 0 |
| 6.87053571428571e-09 | 0 |
| 6.87276785714285e-09 | 0 |
| 6.87499999999999e-09 | 0 |
| 6.87723214285714e-09 | 0 |
| 6.87946428571428e-09 | 0 |
| 6.88169642857142e-09 | 0 |
| 6.88392857142857e-09 | 0 |
| 6.88616071428571e-09 | 0 |
| 6.88839285714285e-09 | 0 |
| 6.89062499999999e-09 | 0 |
| 6.89285714285714e-09 | 0 |
| 6.89508928571428e-09 | 0 |
| 6.89732142857142e-09 | 0 |
| 6.89955357142857e-09 | 0 |
| 6.90178571428571e-09 | 0 |
| 6.90401785714285e-09 | 0 |
| 6.90625e-09 | 0 |
| 6.90848214285714e-09 | 0 |
| 6.91071428571428e-09 | 0 |
| 6.91294642857142e-09 | 0 |
| 6.91517857142857e-09 | 0 |
| 6.91741071428571e-09 | 0 |
| 6.91964285714285e-09 | 0 |
| 6.92187499999999e-09 | 0 |
| 6.92410714285714e-09 | 0 |
| 6.92633928571428e-09 | 0 |
| 6.92857142857142e-09 | 0 |
| 6.93080357142857e-09 | 0 |
| 6.93303571428571e-09 | 0 |
| 6.93526785714285e-09 | 0 |
| 6.9375e-09 | 0 |
| 6.93973214285714e-09 | 0 |
| 6.94196428571428e-09 | 0 |
| 6.94419642857142e-09 | 0 |
| 6.94642857142857e-09 | 0 |
| 6.94866071428571e-09 | 0 |
| 6.95089285714285e-09 | 0 |
| 6.95312499999999e-09 | 0 |
| 6.95535714285714e-09 | 0 |
| 6.95758928571428e-09 | 0 |
| 6.95982142857142e-09 | 0 |
| 6.96205357142857e-09 | 0 |
| 6.96428571428571e-09 | 0 |
| 6.96651785714285e-09 | 0 |
| 6.96874999999999e-09 | 0 |
| 6.97098214285714e-09 | 0 |
| 6.97321428571428e-09 | 0 |
| 6.97544642857142e-09 | 0 |
| 6.97767857142857e-09 | 0 |
| 6.97991071428571e-09 | 0 |
| 6.98214285714285e-09 | 0 |
| 6.984375e-09 | 0 |
| 6.98660714285714e-09 | 0 |
| 6.98883928571428e-09 | 0 |
| 6.99107142857142e-09 | 0 |
| 6.99330357142857e-09 | 0 |
| 6.99553571428571e-09 | 0 |
| 6.99776785714285e-09 | 0 |
| 6.99999999999999e-09 | 0 |
| 7.00223214285714e-09 | 0 |
| 7.00446428571428e-09 | 0 |
| 7.00669642857142e-09 | 0 |
| 7.00892857142857e-09 | 0 |
| 7.01116071428571e-09 | 0 |
| 7.01339285714285e-09 | 0 |
| 7.015625e-09 | 0 |
| 7.01785714285714e-09 | 0 |
| 7.02008928571428e-09 | 0 |
| 7.02232142857142e-09 | 0 |
| 7.02455357142857e-09 | 0 |
| 7.02678571428571e-09 | 0 |
| 7.02901785714285e-09 | 0 |
| 7.03124999999999e-09 | 0 |
| 7.03348214285714e-09 | 0 |
| 7.03571428571428e-09 | 0 |
| 7.03794642857142e-09 | 0 |
| 7.04017857142857e-09 | 0 |
| 7.04241071428571e-09 | 0 |
| 7.04464285714285e-09 | 0 |
| 7.046875e-09 | 0 |
| 7.04910714285714e-09 | 0 |
| 7.05133928571428e-09 | 0 |
| 7.05357142857142e-09 | 0 |
| 7.05580357142857e-09 | 0 |
| 7.05803571428571e-09 | 0 |
| 7.06026785714285e-09 | 0 |
| 7.06249999999999e-09 | 0 |
| 7.06473214285714e-09 | 0 |
| 7.06696428571428e-09 | 0 |
| 7.06919642857142e-09 | 0 |
| 7.07142857142857e-09 | 0 |
| 7.07366071428571e-09 | 0 |
| 7.07589285714285e-09 | 0 |
| 7.07812499999999e-09 | 0 |
| 7.08035714285714e-09 | 0 |
| 7.08258928571428e-09 | 0 |
| 7.08482142857142e-09 | 0 |
| 7.08705357142857e-09 | 0 |
| 7.08928571428571e-09 | 0 |
| 7.09151785714285e-09 | 0 |
| 7.09375e-09 | 0 |
| 7.09598214285714e-09 | 0 |
| 7.09821428571428e-09 | 0 |
| 7.10044642857142e-09 | 0 |
| 7.10267857142857e-09 | 0 |
| 7.10491071428571e-09 | 0 |
| 7.10714285714285e-09 | 0 |
| 7.10937499999999e-09 | 0 |
| 7.11160714285714e-09 | 0 |
| 7.11383928571428e-09 | 0 |
| 7.11607142857142e-09 | 0 |
| 7.11830357142857e-09 | 0 |
| 7.12053571428571e-09 | 0 |
| 7.12276785714285e-09 | 0 |
| 7.125e-09 | 0 |
| 7.12723214285714e-09 | 0 |
| 7.12946428571428e-09 | 0 |
| 7.13169642857142e-09 | 0 |
| 7.13392857142857e-09 | 0 |
| 7.13616071428571e-09 | 0 |
| 7.13839285714285e-09 | 0 |
| 7.14062499999999e-09 | 0 |
| 7.14285714285714e-09 | 0 |
| 7.14508928571428e-09 | 0 |
| 7.14732142857142e-09 | 0 |
| 7.14955357142857e-09 | 0 |
| 7.15178571428571e-09 | 0 |
| 7.15401785714285e-09 | 0 |
| 7.15625e-09 | 0 |
| 7.15848214285714e-09 | 0 |
| 7.16071428571428e-09 | 0 |
| 7.16294642857142e-09 | 0 |
| 7.16517857142857e-09 | 0 |
| 7.16741071428571e-09 | 0 |
| 7.16964285714285e-09 | 0 |
| 7.17187499999999e-09 | 0 |
| 7.17410714285714e-09 | 0 |
| 7.17633928571428e-09 | 0 |
| 7.17857142857142e-09 | 0 |
| 7.18080357142857e-09 | 0 |
| 7.18303571428571e-09 | 0 |
| 7.18526785714285e-09 | 0 |
| 7.18749999999999e-09 | 0 |
| 7.18973214285714e-09 | 0 |
| 7.19196428571428e-09 | 0 |
| 7.19419642857142e-09 | 0 |
| 7.19642857142857e-09 | 0 |
| 7.19866071428571e-09 | 0 |
| 7.20089285714285e-09 | 0 |
| 7.203125e-09 | 0 |
| 7.20535714285714e-09 | 0 |
| 7.20758928571428e-09 | 0 |
| 7.20982142857142e-09 | 0 |
| 7.21205357142857e-09 | 0 |
| 7.21428571428571e-09 | 0 |
| 7.21651785714285e-09 | 0 |
| 7.21874999999999e-09 | 0 |
| 7.22098214285714e-09 | 0 |
| 7.22321428571428e-09 | 0 |
| 7.22544642857142e-09 | 0 |
| 7.22767857142857e-09 | 0 |
| 7.22991071428571e-09 | 0 |
| 7.23214285714285e-09 | 0 |
| 7.234375e-09 | 0 |
| 7.23660714285714e-09 | 0 |
| 7.23883928571428e-09 | 0 |
| 7.24107142857142e-09 | 0 |
| 7.24330357142857e-09 | 0 |
| 7.24553571428571e-09 | 0 |
| 7.24776785714285e-09 | 0 |
| 7.24999999999999e-09 | 0 |
| 7.25223214285714e-09 | 0 |
| 7.25446428571428e-09 | 0 |
| 7.25669642857142e-09 | 0 |
| 7.25892857142857e-09 | 0 |
| 7.26116071428571e-09 | 0 |
| 7.26339285714285e-09 | 0 |
| 7.26562499999999e-09 | 0 |
| 7.26785714285714e-09 | 0 |
| 7.27008928571428e-09 | 0 |
| 7.27232142857142e-09 | 0 |
| 7.27455357142857e-09 | 0 |
| 7.27678571428571e-09 | 0 |
| 7.27901785714285e-09 | 0 |
| 7.28125e-09 | 0 |
| 7.28348214285714e-09 | 0 |
| 7.28571428571428e-09 | 0 |
| 7.28794642857142e-09 | 0 |
| 7.29017857142857e-09 | 0 |
| 7.29241071428571e-09 | 0 |
| 7.29464285714285e-09 | 0 |
| 7.29687499999999e-09 | 0 |
| 7.29910714285714e-09 | 0 |
| 7.30133928571428e-09 | 0 |
| 7.30357142857142e-09 | 0 |
| 7.30580357142857e-09 | 0 |
| 7.30803571428571e-09 | 0 |
| 7.31026785714285e-09 | 0 |
| 7.3125e-09 | 0 |
| 7.31473214285714e-09 | 0 |
| 7.31696428571428e-09 | 0 |
| 7.31919642857142e-09 | 0 |
| 7.32142857142857e-09 | 0 |
| 7.32366071428571e-09 | 0 |
| 7.32589285714285e-09 | 0 |
| 7.32812499999999e-09 | 0 |
| 7.33035714285714e-09 | 0 |
| 7.33258928571428e-09 | 0 |
| 7.33482142857142e-09 | 0 |
| 7.33705357142857e-09 | 0 |
| 7.33928571428571e-09 | 0 |
| 7.34151785714285e-09 | 0 |
| 7.34375e-09 | 0 |
| 7.34598214285714e-09 | 0 |
| 7.34821428571428e-09 | 0 |
| 7.35044642857142e-09 | 0 |
| 7.35267857142857e-09 | 0 |
| 7.35491071428571e-09 | 0 |
| 7.35714285714285e-09 | 0 |
| 7.35937499999999e-09 | 0 |
| 7.36160714285714e-09 | 0 |
| 7.36383928571428e-09 | 0 |
| 7.36607142857142e-09 | 0 |
| 7.36830357142857e-09 | 0 |
| 7.37053571428571e-09 | 0 |
| 7.37276785714285e-09 | 0 |
| 7.37499999999999e-09 | 0 |
| 7.37723214285714e-09 | 0 |
| 7.37946428571428e-09 | 0 |
| 7.38169642857142e-09 | 0 |
| 7.38392857142857e-09 | 0 |
| 7.38616071428571e-09 | 0 |
| 7.38839285714285e-09 | 0 |
| 7.390625e-09 | 0 |
| 7.39285714285714e-09 | 0 |
| 7.39508928571428e-09 | 0 |
| 7.39732142857142e-09 | 0 |
| 7.39955357142857e-09 | 0 |
| 7.40178571428571e-09 | 0 |
| 7.40401785714285e-09 | 0 |
| 7.40624999999999e-09 | 0 |
| 7.40848214285714e-09 | 0 |
| 7.41071428571428e-09 | 0 |
| 7.41294642857142e-09 | 0 |
| 7.41517857142857e-09 | 0 |
| 7.41741071428571e-09 | 0 |
| 7.41964285714285e-09 | 0 |
| 7.421875e-09 | 0 |
| 7.42410714285714e-09 | 0 |
| 7.42633928571428e-09 | 0 |
| 7.42857142857142e-09 | 0 |
| 7.43080357142857e-09 | 0 |
| 7.43303571428571e-09 | 0 |
| 7.43526785714285e-09 | 0 |
| 7.43749999999999e-09 | 0 |
| 7.43973214285714e-09 | 0 |
| 7.44196428571428e-09 | 0 |
| 7.44419642857142e-09 | 0 |
| 7.44642857142857e-09 | 0 |
| 7.44866071428571e-09 | 0 |
| 7.45089285714285e-09 | 0 |
| 7.45312499999999e-09 | 0 |
| 7.45535714285714e-09 | 0 |
| 7.45758928571428e-09 | 0 |
| 7.45982142857142e-09 | 0 |
| 7.46205357142857e-09 | 0 |
| 7.46428571428571e-09 | 0 |
| 7.46651785714285e-09 | 0 |
| 7.46875e-09 | 0 |
| 7.47098214285714e-09 | 0 |
| 7.47321428571428e-09 | 0 |
| 7.47544642857142e-09 | 0 |
| 7.47767857142857e-09 | 0 |
| 7.47991071428571e-09 | 0 |
| 7.48214285714285e-09 | 0 |
| 7.48437499999999e-09 | 0 |
| 7.48660714285714e-09 | 0 |
| 7.48883928571428e-09 | 0 |
| 7.49107142857142e-09 | 0 |
| 7.49330357142857e-09 | 0 |
| 7.49553571428571e-09 | 0 |
| 7.49776785714285e-09 | 0 |
| 7.49999999999999e-09 | 0 |
| 7.50223214285714e-09 | 0 |
| 7.50446428571428e-09 | 0 |
| 7.50669642857142e-09 | 0 |
| 7.50892857142857e-09 | 0 |
| 7.51116071428571e-09 | 0 |
| 7.51339285714285e-09 | 0 |
| 7.515625e-09 | 0 |
| 7.51785714285714e-09 | 0 |
| 7.52008928571428e-09 | 0 |
| 7.52232142857142e-09 | 0 |
| 7.52455357142857e-09 | 0 |
| 7.52678571428571e-09 | 0 |
| 7.52901785714285e-09 | 0 |
| 7.53125e-09 | 0 |
| 7.53348214285714e-09 | 0 |
| 7.53571428571428e-09 | 0 |
| 7.53794642857142e-09 | 0 |
| 7.54017857142857e-09 | 0 |
| 7.54241071428571e-09 | 0 |
| 7.54464285714285e-09 | 0 |
| 7.54687499999999e-09 | 0 |
| 7.54910714285714e-09 | 0 |
| 7.55133928571428e-09 | 0 |
| 7.55357142857142e-09 | 0 |
| 7.55580357142857e-09 | 0 |
| 7.55803571428571e-09 | 0 |
| 7.56026785714285e-09 | 0 |
| 7.56249999999999e-09 | 0 |
| 7.56473214285714e-09 | 0 |
| 7.56696428571428e-09 | 0 |
| 7.56919642857142e-09 | 0 |
| 7.57142857142857e-09 | 0 |
| 7.57366071428571e-09 | 0 |
| 7.57589285714285e-09 | 0 |
| 7.578125e-09 | 0 |
| 7.58035714285714e-09 | 0 |
| 7.58258928571428e-09 | 0 |
| 7.58482142857142e-09 | 0 |
| 7.58705357142857e-09 | 0 |
| 7.58928571428571e-09 | 0 |
| 7.59151785714285e-09 | 0 |
| 7.59374999999999e-09 | 0 |
| 7.59598214285714e-09 | 0 |
| 7.59821428571428e-09 | 0 |
| 7.60044642857142e-09 | 0 |
| 7.60267857142857e-09 | 0 |
| 7.60491071428571e-09 | 0 |
| 7.60714285714285e-09 | 0 |
| 7.60937499999999e-09 | 0 |
| 7.61160714285714e-09 | 0 |
| 7.61383928571428e-09 | 0 |
| 7.61607142857142e-09 | 0 |
| 7.61830357142857e-09 | 0 |
| 7.62053571428571e-09 | 0 |
| 7.62276785714285e-09 | 0 |
| 7.625e-09 | 0 |
| 7.62723214285714e-09 | 0 |
| 7.62946428571428e-09 | 0 |
| 7.63169642857142e-09 | 0 |
| 7.63392857142857e-09 | 0 |
| 7.63616071428571e-09 | 0 |
| 7.63839285714285e-09 | 0 |
| 7.640625e-09 | 0 |
| 7.64285714285714e-09 | 0 |
| 7.64508928571428e-09 | 0 |
| 7.64732142857142e-09 | 0 |
| 7.64955357142857e-09 | 0 |
| 7.65178571428571e-09 | 0 |
| 7.65401785714285e-09 | 0 |
| 7.65624999999999e-09 | 0 |
| 7.65848214285714e-09 | 0 |
| 7.66071428571428e-09 | 0 |
| 7.66294642857142e-09 | 0 |
| 7.66517857142857e-09 | 0 |
| 7.66741071428571e-09 | 0 |
| 7.66964285714285e-09 | 0 |
| 7.671875e-09 | 0 |
| 7.67410714285714e-09 | 0 |
| 7.67633928571428e-09 | 0 |
| 7.67857142857142e-09 | 0 |
| 7.68080357142857e-09 | 0 |
| 7.68303571428571e-09 | 0 |
| 7.68526785714285e-09 | 0 |
| 7.6875e-09 | 0 |
| 7.68973214285714e-09 | 0 |
| 7.69196428571428e-09 | 0 |
| 7.69419642857142e-09 | 0 |
| 7.69642857142857e-09 | 0 |
| 7.69866071428571e-09 | 0 |
| 7.70089285714285e-09 | 0 |
| 7.70312499999999e-09 | 0 |
| 7.70535714285714e-09 | 0 |
| 7.70758928571428e-09 | 0 |
| 7.70982142857142e-09 | 0 |
| 7.71205357142857e-09 | 0 |
| 7.71428571428571e-09 | 0 |
| 7.71651785714285e-09 | 0 |
| 7.71874999999999e-09 | 0 |
| 7.72098214285714e-09 | 0 |
| 7.72321428571428e-09 | 0 |
| 7.72544642857142e-09 | 0 |
| 7.72767857142857e-09 | 0 |
| 7.72991071428571e-09 | 0 |
| 7.73214285714285e-09 | 0 |
| 7.734375e-09 | 0 |
| 7.73660714285714e-09 | 0 |
| 7.73883928571428e-09 | 0 |
| 7.74107142857142e-09 | 0 |
| 7.74330357142857e-09 | 0 |
| 7.74553571428571e-09 | 0 |
| 7.74776785714285e-09 | 0 |
| 7.74999999999999e-09 | 0 |
| 7.75223214285714e-09 | 0 |
| 7.75446428571428e-09 | 0 |
| 7.75669642857142e-09 | 0 |
| 7.75892857142857e-09 | 0 |
| 7.76116071428571e-09 | 0 |
| 7.76339285714285e-09 | 0 |
| 7.76562499999999e-09 | 0 |
| 7.76785714285714e-09 | 0 |
| 7.77008928571428e-09 | 0 |
| 7.77232142857142e-09 | 0 |
| 7.77455357142857e-09 | 0 |
| 7.77678571428571e-09 | 0 |
| 7.77901785714285e-09 | 0 |
| 7.78125e-09 | 0 |
| 7.78348214285714e-09 | 0 |
| 7.78571428571428e-09 | 0 |
| 7.78794642857142e-09 | 0 |
| 7.79017857142857e-09 | 0 |
| 7.79241071428571e-09 | 0 |
| 7.79464285714285e-09 | 0 |
| 7.796875e-09 | 0 |
| 7.79910714285714e-09 | 0 |
| 7.80133928571428e-09 | 0 |
| 7.80357142857142e-09 | 0 |
| 7.80580357142857e-09 | 0 |
| 7.80803571428571e-09 | 0 |
| 7.81026785714285e-09 | 0 |
| 7.81249999999999e-09 | 0 |
| 7.81473214285714e-09 | 0 |
| 7.81696428571428e-09 | 0 |
| 7.81919642857142e-09 | 0 |
| 7.82142857142857e-09 | 0 |
| 7.82366071428571e-09 | 0 |
| 7.82589285714285e-09 | 0 |
| 7.82812499999999e-09 | 0 |
| 7.83035714285714e-09 | 0 |
| 7.83258928571428e-09 | 0 |
| 7.83482142857142e-09 | 0 |
| 7.83705357142857e-09 | 0 |
| 7.83928571428571e-09 | 0 |
| 7.84151785714285e-09 | 0 |
| 7.84375e-09 | 0 |
| 7.84598214285714e-09 | 0 |
| 7.84821428571428e-09 | 0 |
| 7.85044642857142e-09 | 0 |
| 7.85267857142857e-09 | 0 |
| 7.85491071428571e-09 | 0 |
| 7.85714285714285e-09 | 0 |
| 7.85937499999999e-09 | 0 |
| 7.86160714285714e-09 | 0 |
| 7.86383928571428e-09 | 0 |
| 7.86607142857142e-09 | 0 |
| 7.86830357142857e-09 | 0 |
| 7.87053571428571e-09 | 0 |
| 7.87276785714285e-09 | 0 |
| 7.87499999999999e-09 | 0 |
| 7.87723214285714e-09 | 0 |
| 7.87946428571428e-09 | 0 |
| 7.88169642857142e-09 | 0 |
| 7.88392857142857e-09 | 0 |
| 7.88616071428571e-09 | 0 |
| 7.88839285714285e-09 | 0 |
| 7.890625e-09 | 0 |
| 7.89285714285714e-09 | 0 |
| 7.89508928571428e-09 | 0 |
| 7.89732142857142e-09 | 0 |
| 7.89955357142857e-09 | 0 |
| 7.90178571428571e-09 | 0 |
| 7.90401785714285e-09 | 0 |
| 7.90625e-09 | 0 |
| 7.90848214285714e-09 | 0 |
| 7.91071428571428e-09 | 0 |
| 7.91294642857142e-09 | 0 |
| 7.91517857142857e-09 | 0 |
| 7.91741071428571e-09 | 0 |
| 7.91964285714285e-09 | 0 |
| 7.92187499999999e-09 | 0 |
| 7.92410714285714e-09 | 0 |
| 7.92633928571428e-09 | 0 |
| 7.92857142857142e-09 | 0 |
| 7.93080357142857e-09 | 0 |
| 7.93303571428571e-09 | 0 |
| 7.93526785714285e-09 | 0 |
| 7.93749999999999e-09 | 0 |
| 7.93973214285714e-09 | 0 |
| 7.94196428571428e-09 | 0 |
| 7.94419642857142e-09 | 0 |
| 7.94642857142857e-09 | 0 |
| 7.94866071428571e-09 | 0 |
| 7.95089285714285e-09 | 0 |
| 7.953125e-09 | 0 |
| 7.95535714285714e-09 | 0 |
| 7.95758928571428e-09 | 0 |
| 7.95982142857142e-09 | 0 |
| 7.96205357142857e-09 | 0 |
| 7.96428571428571e-09 | 0 |
| 7.96651785714285e-09 | 0 |
| 7.96874999999999e-09 | 0 |
| 7.97098214285714e-09 | 0 |
| 7.97321428571428e-09 | 0 |
| 7.97544642857142e-09 | 0 |
| 7.97767857142857e-09 | 0 |
| 7.97991071428571e-09 | 0 |
| 7.98214285714285e-09 | 0 |
| 7.98437499999999e-09 | 0 |
| 7.98660714285714e-09 | 0 |
| 7.98883928571428e-09 | 0 |
| 7.99107142857142e-09 | 0 |
| 7.99330357142857e-09 | 0 |
| 7.99553571428571e-09 | 0 |
| 7.99776785714285e-09 | 0 |
| 8e-09 | 0 |
| 8.00223214285714e-09 | 0 |
| 8.00446428571428e-09 | 0 |
| 8.00669642857142e-09 | 0 |
| 8.00892857142857e-09 | 0 |
| 8.01116071428571e-09 | 0 |
| 8.01339285714285e-09 | 0 |
| 8.015625e-09 | 0 |
| 8.01785714285714e-09 | 0 |
| 8.02008928571428e-09 | 0 |
| 8.02232142857142e-09 | 0 |
| 8.02455357142857e-09 | 0 |
| 8.02678571428571e-09 | 0 |
| 8.02901785714285e-09 | 0 |
| 8.03124999999999e-09 | 0 |
| 8.03348214285714e-09 | 0 |
| 8.03571428571428e-09 | 0 |
| 8.03794642857142e-09 | 0 |
| 8.04017857142857e-09 | 0 |
| 8.04241071428571e-09 | 0 |
| 8.04464285714285e-09 | 0 |
| 8.04687499999999e-09 | 0 |
| 8.04910714285714e-09 | 0 |
| 8.05133928571428e-09 | 0 |
| 8.05357142857142e-09 | 0 |
| 8.05580357142857e-09 | 0 |
| 8.05803571428571e-09 | 0 |
| 8.06026785714285e-09 | 0 |
| 8.0625e-09 | 0 |
| 8.06473214285714e-09 | 0 |
| 8.06696428571428e-09 | 0 |
| 8.06919642857142e-09 | 0 |
| 8.07142857142857e-09 | 0 |
| 8.07366071428571e-09 | 0 |
| 8.07589285714285e-09 | 0 |
| 8.07812499999999e-09 | 0 |
| 8.08035714285714e-09 | 0 |
| 8.08258928571428e-09 | 0 |
| 8.08482142857142e-09 | 0 |
| 8.08705357142857e-09 | 0 |
| 8.08928571428571e-09 | 0 |
| 8.09151785714285e-09 | 0 |
| 8.09374999999999e-09 | 0 |
| 8.09598214285714e-09 | 0 |
| 8.09821428571428e-09 | 0 |
| 8.10044642857142e-09 | 0 |
| 8.10267857142857e-09 | 0 |
| 8.10491071428571e-09 | 0 |
| 8.10714285714285e-09 | 0 |
| 8.109375e-09 | 0 |
| 8.11160714285714e-09 | 0 |
| 8.11383928571428e-09 | 0 |
| 8.11607142857142e-09 | 0 |
| 8.11830357142857e-09 | 0 |
| 8.12053571428571e-09 | 0 |
| 8.12276785714285e-09 | 0 |
| 8.125e-09 | 0 |
| 8.12723214285714e-09 | 0 |
| 8.12946428571428e-09 | 0 |
| 8.13169642857142e-09 | 0 |
| 8.13392857142857e-09 | 0 |
| 8.13616071428571e-09 | 0 |
| 8.13839285714285e-09 | 0 |
| 8.14062499999999e-09 | 0 |
| 8.14285714285714e-09 | 0 |
| 8.14508928571428e-09 | 0 |
| 8.14732142857142e-09 | 0 |
| 8.14955357142857e-09 | 0 |
| 8.15178571428571e-09 | 0 |
| 8.15401785714285e-09 | 0 |
| 8.15625e-09 | 0 |
| 8.15848214285714e-09 | 0 |
| 8.16071428571428e-09 | 0 |
| 8.16294642857142e-09 | 0 |
| 8.16517857142857e-09 | 0 |
| 8.16741071428571e-09 | 0 |
| 8.16964285714285e-09 | 0 |
| 8.171875e-09 | 0 |
| 8.17410714285714e-09 | 0 |
| 8.17633928571428e-09 | 0 |
| 8.17857142857142e-09 | 0 |
| 8.18080357142857e-09 | 0 |
| 8.18303571428571e-09 | 0 |
| 8.18526785714285e-09 | 0 |
| 8.18749999999999e-09 | 0 |
| 8.18973214285714e-09 | 0 |
| 8.19196428571428e-09 | 0 |
| 8.19419642857142e-09 | 0 |
| 8.19642857142857e-09 | 0 |
| 8.19866071428571e-09 | 0 |
| 8.20089285714285e-09 | 0 |
| 8.20312499999999e-09 | 0 |
| 8.20535714285714e-09 | 0 |
| 8.20758928571428e-09 | 0 |
| 8.20982142857142e-09 | 0 |
| 8.21205357142857e-09 | 0 |
| 8.21428571428571e-09 | 0 |
| 8.21651785714285e-09 | 0 |
| 8.21875e-09 | 0 |
| 8.22098214285714e-09 | 0 |
| 8.22321428571428e-09 | 0 |
| 8.22544642857142e-09 | 0 |
| 8.22767857142857e-09 | 0 |
| 8.22991071428571e-09 | 0 |
| 8.23214285714285e-09 | 0 |
| 8.23437499999999e-09 | 0 |
| 8.23660714285714e-09 | 0 |
| 8.23883928571428e-09 | 0 |
| 8.24107142857142e-09 | 0 |
| 8.24330357142857e-09 | 0 |
| 8.24553571428571e-09 | 0 |
| 8.24776785714285e-09 | 0 |
| 8.24999999999999e-09 | 0 |
| 8.25223214285714e-09 | 0 |
| 8.25446428571428e-09 | 0 |
| 8.25669642857142e-09 | 0 |
| 8.25892857142857e-09 | 0 |
| 8.26116071428571e-09 | 0 |
| 8.26339285714285e-09 | 0 |
| 8.265625e-09 | 0 |
| 8.26785714285714e-09 | 0 |
| 8.27008928571428e-09 | 0 |
| 8.27232142857142e-09 | 0 |
| 8.27455357142857e-09 | 0 |
| 8.27678571428571e-09 | 0 |
| 8.27901785714285e-09 | 0 |
| 8.28125e-09 | 0 |
| 8.28348214285714e-09 | 0 |
| 8.28571428571428e-09 | 0 |
| 8.28794642857142e-09 | 0 |
| 8.29017857142857e-09 | 0 |
| 8.29241071428571e-09 | 0 |
| 8.29464285714285e-09 | 0 |
| 8.29687499999999e-09 | 0 |
| 8.29910714285714e-09 | 0 |
| 8.30133928571428e-09 | 0 |
| 8.30357142857142e-09 | 0 |
| 8.30580357142857e-09 | 0 |
| 8.30803571428571e-09 | 0 |
| 8.31026785714285e-09 | 0 |
| 8.31249999999999e-09 | 0 |
| 8.31473214285714e-09 | 0 |
| 8.31696428571428e-09 | 0 |
| 8.31919642857142e-09 | 0 |
| 8.32142857142857e-09 | 0 |
| 8.32366071428571e-09 | 0 |
| 8.32589285714285e-09 | 0 |
| 8.328125e-09 | 0 |
| 8.33035714285714e-09 | 0 |
| 8.33258928571428e-09 | 0 |
| 8.33482142857142e-09 | 0 |
| 8.33705357142857e-09 | 0 |
| 8.33928571428571e-09 | 0 |
| 8.34151785714285e-09 | 0 |
| 8.34374999999999e-09 | 0 |
| 8.34598214285714e-09 | 0 |
| 8.34821428571428e-09 | 0 |
| 8.35044642857142e-09 | 0 |
| 8.35267857142857e-09 | 0 |
| 8.35491071428571e-09 | 0 |
| 8.35714285714285e-09 | 0 |
| 8.35937499999999e-09 | 0 |
| 8.36160714285714e-09 | 0 |
| 8.36383928571428e-09 | 0 |
| 8.36607142857142e-09 | 0 |
| 8.36830357142857e-09 | 0 |
| 8.37053571428571e-09 | 0 |
| 8.37276785714285e-09 | 0 |
| 8.375e-09 | 0 |
| 8.37723214285714e-09 | 0 |
| 8.37946428571428e-09 | 0 |
| 8.38169642857142e-09 | 0 |
| 8.38392857142857e-09 | 0 |
| 8.38616071428571e-09 | 0 |
| 8.38839285714285e-09 | 0 |
| 8.390625e-09 | 0 |
| 8.39285714285714e-09 | 0 |
| 8.39508928571428e-09 | 0 |
| 8.39732142857142e-09 | 0 |
| 8.39955357142857e-09 | 0 |
| 8.40178571428571e-09 | 0 |
| 8.40401785714285e-09 | 0 |
| 8.40624999999999e-09 | 0 |
| 8.40848214285714e-09 | 0 |
| 8.41071428571428e-09 | 0 |
| 8.41294642857142e-09 | 0 |
| 8.41517857142857e-09 | 0 |
| 8.41741071428571e-09 | 0 |
| 8.41964285714285e-09 | 0 |
| 8.42187499999999e-09 | 0 |
| 8.42410714285714e-09 | 0 |
| 8.42633928571428e-09 | 0 |
| 8.42857142857142e-09 | 0 |
| 8.43080357142857e-09 | 0 |
| 8.43303571428571e-09 | 0 |
| 8.43526785714285e-09 | 0 |
| 8.4375e-09 | 0 |
| 8.43973214285714e-09 | 0 |
| 8.44196428571428e-09 | 0 |
| 8.44419642857142e-09 | 0 |
| 8.44642857142857e-09 | 0 |
| 8.44866071428571e-09 | 0 |
| 8.45089285714285e-09 | 0 |
| 8.45312499999999e-09 | 0 |
| 8.45535714285714e-09 | 0 |
| 8.45758928571428e-09 | 0 |
| 8.45982142857142e-09 | 0 |
| 8.46205357142857e-09 | 0 |
| 8.46428571428571e-09 | 0 |
| 8.46651785714285e-09 | 0 |
| 8.46874999999999e-09 | 0 |
| 8.47098214285714e-09 | 0 |
| 8.47321428571428e-09 | 0 |
| 8.47544642857142e-09 | 0 |
| 8.47767857142857e-09 | 0 |
| 8.47991071428571e-09 | 0 |
| 8.48214285714285e-09 | 0 |
| 8.484375e-09 | 0 |
| 8.48660714285714e-09 | 0 |
| 8.48883928571428e-09 | 0 |
| 8.49107142857142e-09 | 0 |
| 8.49330357142857e-09 | 0 |
| 8.49553571428571e-09 | 0 |
| 8.49776785714285e-09 | 0 |
| 8.5e-09 | 0 |
| 8.50223214285714e-09 | 0 |
| 8.50446428571428e-09 | 0 |
| 8.50669642857142e-09 | 0 |
| 8.50892857142857e-09 | 0 |
| 8.51116071428571e-09 | 0 |
| 8.51339285714285e-09 | 0 |
| 8.51562499999999e-09 | 0 |
| 8.51785714285714e-09 | 0 |
| 8.52008928571428e-09 | 0 |
| 8.52232142857142e-09 | 0 |
| 8.52455357142857e-09 | 0 |
| 8.52678571428571e-09 | 0 |
| 8.52901785714285e-09 | 0 |
| 8.53124999999999e-09 | 0 |
| 8.53348214285714e-09 | 0 |
| 8.53571428571428e-09 | 0 |
| 8.53794642857142e-09 | 0 |
| 8.54017857142857e-09 | 0 |
| 8.54241071428571e-09 | 0 |
| 8.54464285714285e-09 | 0 |
| 8.546875e-09 | 0 |
| 8.54910714285714e-09 | 0 |
| 8.55133928571428e-09 | 0 |
| 8.55357142857142e-09 | 0 |
| 8.55580357142857e-09 | 0 |
| 8.55803571428571e-09 | 0 |
| 8.56026785714285e-09 | 0 |
| 8.56249999999999e-09 | 0 |
| 8.56473214285714e-09 | 0 |
| 8.56696428571428e-09 | 0 |
| 8.56919642857142e-09 | 0 |
| 8.57142857142857e-09 | 0 |
| 8.57366071428571e-09 | 0 |
| 8.57589285714285e-09 | 0 |
| 8.57812499999999e-09 | 0 |
| 8.58035714285714e-09 | 0 |
| 8.58258928571428e-09 | 0 |
| 8.58482142857142e-09 | 0 |
| 8.58705357142857e-09 | 0 |
| 8.58928571428571e-09 | 0 |
| 8.59151785714285e-09 | 0 |
| 8.59375e-09 | 0 |
| 8.59598214285714e-09 | 0 |
| 8.59821428571428e-09 | 0 |
| 8.60044642857142e-09 | 0 |
| 8.60267857142857e-09 | 0 |
| 8.60491071428571e-09 | 0 |
| 8.60714285714285e-09 | 0 |
| 8.609375e-09 | 0 |
| 8.61160714285714e-09 | 0 |
| 8.61383928571428e-09 | 0 |
| 8.61607142857142e-09 | 0 |
| 8.61830357142857e-09 | 0 |
| 8.62053571428571e-09 | 0 |
| 8.62276785714285e-09 | 0 |
| 8.62499999999999e-09 | 0 |
| 8.62723214285714e-09 | 0 |
| 8.62946428571428e-09 | 0 |
| 8.63169642857142e-09 | 0 |
| 8.63392857142857e-09 | 0 |
| 8.63616071428571e-09 | 0 |
| 8.63839285714285e-09 | 0 |
| 8.640625e-09 | 0 |
| 8.64285714285714e-09 | 0 |
| 8.64508928571428e-09 | 0 |
| 8.64732142857142e-09 | 0 |
| 8.64955357142857e-09 | 0 |
| 8.65178571428571e-09 | 0 |
| 8.65401785714285e-09 | 0 |
| 8.65625e-09 | 0 |
| 8.65848214285714e-09 | 0 |
| 8.66071428571428e-09 | 0 |
| 8.66294642857142e-09 | 0 |
| 8.66517857142857e-09 | 0 |
| 8.66741071428571e-09 | 0 |
| 8.66964285714285e-09 | 0 |
| 8.67187499999999e-09 | 0 |
| 8.67410714285714e-09 | 0 |
| 8.67633928571428e-09 | 0 |
| 8.67857142857142e-09 | 0 |
| 8.68080357142857e-09 | 0 |
| 8.68303571428571e-09 | 0 |
| 8.68526785714285e-09 | 0 |
| 8.68749999999999e-09 | 0 |
| 8.68973214285714e-09 | 0 |
| 8.69196428571428e-09 | 0 |
| 8.69419642857142e-09 | 0 |
| 8.69642857142857e-09 | 0 |
| 8.69866071428571e-09 | 0 |
| 8.70089285714285e-09 | 0 |
| 8.703125e-09 | 0 |
| 8.70535714285714e-09 | 0 |
| 8.70758928571428e-09 | 0 |
| 8.70982142857142e-09 | 0 |
| 8.71205357142857e-09 | 0 |
| 8.71428571428571e-09 | 0 |
| 8.71651785714285e-09 | 0 |
| 8.71874999999999e-09 | 0 |
| 8.72098214285714e-09 | 0 |
| 8.72321428571428e-09 | 0 |
| 8.72544642857142e-09 | 0 |
| 8.72767857142857e-09 | 0 |
| 8.72991071428571e-09 | 0 |
| 8.73214285714285e-09 | 0 |
| 8.73437499999999e-09 | 0 |
| 8.73660714285714e-09 | 0 |
| 8.73883928571428e-09 | 0 |
| 8.74107142857142e-09 | 0 |
| 8.74330357142857e-09 | 0 |
| 8.74553571428571e-09 | 0 |
| 8.74776785714285e-09 | 0 |
| 8.75e-09 | 0 |
| 8.75223214285714e-09 | 0 |
| 8.75446428571428e-09 | 0 |
| 8.75669642857142e-09 | 0 |
| 8.75892857142857e-09 | 0 |
| 8.76116071428571e-09 | 0 |
| 8.76339285714285e-09 | 0 |
| 8.765625e-09 | 0 |
| 8.76785714285714e-09 | 0 |
| 8.77008928571428e-09 | 0 |
| 8.77232142857142e-09 | 0 |
| 8.77455357142857e-09 | 0 |
| 8.77678571428571e-09 | 0 |
| 8.77901785714285e-09 | 0 |
| 8.78124999999999e-09 | 0 |
| 8.78348214285714e-09 | 0 |
| 8.78571428571428e-09 | 0 |
| 8.78794642857142e-09 | 0 |
| 8.79017857142857e-09 | 0 |
| 8.79241071428571e-09 | 0 |
| 8.79464285714285e-09 | 0 |
| 8.79687499999999e-09 | 0 |
| 8.79910714285714e-09 | 0 |
| 8.80133928571428e-09 | 0 |
| 8.80357142857142e-09 | 0 |
| 8.80580357142857e-09 | 0 |
| 8.80803571428571e-09 | 0 |
| 8.81026785714285e-09 | 0 |
| 8.8125e-09 | 0 |
| 8.81473214285714e-09 | 0 |
| 8.81696428571428e-09 | 0 |
| 8.81919642857142e-09 | 0 |
| 8.82142857142857e-09 | 0 |
| 8.82366071428571e-09 | 0 |
| 8.82589285714285e-09 | 0 |
| 8.82812499999999e-09 | 0 |
| 8.83035714285714e-09 | 0 |
| 8.83258928571428e-09 | 0 |
| 8.83482142857142e-09 | 0 |
| 8.83705357142857e-09 | 0 |
| 8.83928571428571e-09 | 0 |
| 8.84151785714285e-09 | 0 |
| 8.84374999999999e-09 | 0 |
| 8.84598214285714e-09 | 0 |
| 8.84821428571428e-09 | 0 |
| 8.85044642857142e-09 | 0 |
| 8.85267857142857e-09 | 0 |
| 8.85491071428571e-09 | 0 |
| 8.85714285714285e-09 | 0 |
| 8.859375e-09 | 0 |
| 8.86160714285714e-09 | 0 |
| 8.86383928571428e-09 | 0 |
| 8.86607142857142e-09 | 0 |
| 8.86830357142857e-09 | 0 |
| 8.87053571428571e-09 | 0 |
| 8.87276785714285e-09 | 0 |
| 8.875e-09 | 0 |
| 8.87723214285714e-09 | 0 |
| 8.87946428571428e-09 | 0 |
| 8.88169642857142e-09 | 0 |
| 8.88392857142857e-09 | 0 |
| 8.88616071428571e-09 | 0 |
| 8.88839285714285e-09 | 0 |
| 8.89062499999999e-09 | 0 |
| 8.89285714285714e-09 | 0 |
| 8.89508928571428e-09 | 0 |
| 8.89732142857142e-09 | 0 |
| 8.89955357142857e-09 | 0 |
| 8.90178571428571e-09 | 0 |
| 8.90401785714285e-09 | 0 |
| 8.90624999999999e-09 | 0 |
| 8.90848214285714e-09 | 0 |
| 8.91071428571428e-09 | 0 |
| 8.91294642857142e-09 | 0 |
| 8.91517857142857e-09 | 0 |
| 8.91741071428571e-09 | 0 |
| 8.91964285714285e-09 | 0 |
| 8.921875e-09 | 0 |
| 8.92410714285714e-09 | 0 |
| 8.92633928571428e-09 | 0 |
| 8.92857142857142e-09 | 0 |
| 8.93080357142857e-09 | 0 |
| 8.93303571428571e-09 | 0 |
| 8.93526785714285e-09 | 0 |
| 8.93749999999999e-09 | 0 |
| 8.93973214285714e-09 | 0 |
| 8.94196428571428e-09 | 0 |
| 8.94419642857142e-09 | 0 |
| 8.94642857142857e-09 | 0 |
| 8.94866071428571e-09 | 0 |
| 8.95089285714285e-09 | 0 |
| 8.95312499999999e-09 | 0 |
| 8.95535714285714e-09 | 0 |
| 8.95758928571428e-09 | 0 |
| 8.95982142857142e-09 | 0 |
| 8.96205357142857e-09 | 0 |
| 8.96428571428571e-09 | 0 |
| 8.96651785714285e-09 | 0 |
| 8.96875e-09 | 0 |
| 8.97098214285714e-09 | 0 |
| 8.97321428571428e-09 | 0 |
| 8.97544642857142e-09 | 0 |
| 8.97767857142857e-09 | 0 |
| 8.97991071428571e-09 | 0 |
| 8.98214285714285e-09 | 0 |
| 8.984375e-09 | 0 |
| 8.98660714285714e-09 | 0 |
| 8.98883928571428e-09 | 0 |
| 8.99107142857142e-09 | 0 |
| 8.99330357142857e-09 | 0 |
| 8.99553571428571e-09 | 0 |
| 8.99776785714285e-09 | 0 |
| 8.99999999999999e-09 | 0 |
| 9.00223214285714e-09 | 0 |
| 9.00446428571428e-09 | 0 |
| 9.00669642857142e-09 | 0 |
| 9.00892857142857e-09 | 0 |
| 9.01116071428571e-09 | 0 |
| 9.01339285714285e-09 | 0 |
| 9.01562499999999e-09 | 0 |
| 9.01785714285714e-09 | 0 |
| 9.02008928571428e-09 | 0 |
| 9.02232142857142e-09 | 0 |
| 9.02455357142857e-09 | 0 |
| 9.02678571428571e-09 | 0 |
| 9.02901785714285e-09 | 0 |
| 9.03125e-09 | 0 |
| 9.03348214285714e-09 | 0 |
| 9.03571428571428e-09 | 0 |
| 9.03794642857142e-09 | 0 |
| 9.04017857142857e-09 | 0 |
| 9.04241071428571e-09 | 0 |
| 9.04464285714285e-09 | 0 |
| 9.04687499999999e-09 | 0 |
| 9.04910714285714e-09 | 0 |
| 9.05133928571428e-09 | 0 |
| 9.05357142857142e-09 | 0 |
| 9.05580357142857e-09 | 0 |
| 9.05803571428571e-09 | 0 |
| 9.06026785714285e-09 | 0 |
| 9.06249999999999e-09 | 0 |
| 9.06473214285714e-09 | 0 |
| 9.06696428571428e-09 | 0 |
| 9.06919642857142e-09 | 0 |
| 9.07142857142857e-09 | 0 |
| 9.07366071428571e-09 | 0 |
| 9.07589285714285e-09 | 0 |
| 9.078125e-09 | 0 |
| 9.08035714285714e-09 | 0 |
| 9.08258928571428e-09 | 0 |
| 9.08482142857142e-09 | 0 |
| 9.08705357142857e-09 | 0 |
| 9.08928571428571e-09 | 0 |
| 9.09151785714285e-09 | 0 |
| 9.09375e-09 | 0 |
| 9.09598214285714e-09 | 0 |
| 9.09821428571428e-09 | 0 |
| 9.10044642857142e-09 | 0 |
| 9.10267857142857e-09 | 0 |
| 9.10491071428571e-09 | 0 |
| 9.10714285714285e-09 | 0 |
| 9.10937499999999e-09 | 0 |
| 9.11160714285714e-09 | 0 |
| 9.11383928571428e-09 | 0 |
| 9.11607142857142e-09 | 0 |
| 9.11830357142857e-09 | 0 |
| 9.12053571428571e-09 | 0 |
| 9.12276785714285e-09 | 0 |
| 9.125e-09 | 0 |
| 9.12723214285714e-09 | 0 |
| 9.12946428571428e-09 | 0 |
| 9.13169642857142e-09 | 0 |
| 9.13392857142857e-09 | 0 |
| 9.13616071428571e-09 | 0 |
| 9.13839285714285e-09 | 0 |
| 9.140625e-09 | 0 |